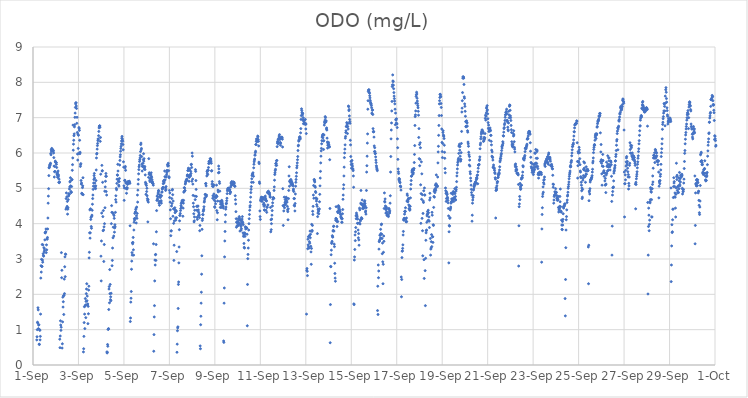
| Category | ODO (mg/L) |
|---|---|
| 44440.166666666664 | 0.71 |
| 44440.177083333336 | 0.8 |
| 44440.1875 | 1 |
| 44440.197916666664 | 1.21 |
| 44440.208333333336 | 1.19 |
| 44440.21875 | 1.62 |
| 44440.229166666664 | 1.56 |
| 44440.239583333336 | 1.03 |
| 44440.25 | 1.13 |
| 44440.260416666664 | 1.14 |
| 44440.270833333336 | 0.59 |
| 44440.28125 | 0.58 |
| 44440.291666666664 | 1 |
| 44440.302083333336 | 0.98 |
| 44440.3125 | 0.71 |
| 44440.322916666664 | 0.81 |
| 44440.333333333336 | 1.44 |
| 44440.34375 | 2.46 |
| 44440.354166666664 | 2.81 |
| 44440.364583333336 | 2.63 |
| 44440.375 | 2.99 |
| 44440.385416666664 | 2.79 |
| 44440.395833333336 | 2.79 |
| 44440.40625 | 3.41 |
| 44440.416666666664 | 2.97 |
| 44440.427083333336 | 2.91 |
| 44440.4375 | 3.4 |
| 44440.447916666664 | 3.15 |
| 44440.458333333336 | 3.1 |
| 44440.46875 | 3.08 |
| 44440.479166666664 | 3.32 |
| 44440.489583333336 | 3.2 |
| 44440.5 | 3.29 |
| 44440.510416666664 | 3.24 |
| 44440.520833333336 | 3.54 |
| 44440.53125 | 3.74 |
| 44440.541666666664 | 3.74 |
| 44440.552083333336 | 3.76 |
| 44440.5625 | 3.77 |
| 44440.572916666664 | 3.85 |
| 44440.583333333336 | 3.18 |
| 44440.59375 | 3.4 |
| 44440.604166666664 | 3.26 |
| 44440.614583333336 | 3.57 |
| 44440.625 | 3.56 |
| 44440.635416666664 | 3.61 |
| 44440.645833333336 | 3.85 |
| 44440.65625 | 4.16 |
| 44440.666666666664 | 4.58 |
| 44440.677083333336 | 4.78 |
| 44440.6875 | 4.99 |
| 44440.697916666664 | 5.36 |
| 44440.708333333336 | 5.58 |
| 44440.71875 | 5.59 |
| 44440.729166666664 | 5.63 |
| 44440.739583333336 | 5.67 |
| 44440.75 | 5.65 |
| 44440.760416666664 | 5.69 |
| 44440.770833333336 | 5.71 |
| 44440.78125 | 5.99 |
| 44440.791666666664 | 5.95 |
| 44440.802083333336 | 6.09 |
| 44440.8125 | 6.05 |
| 44440.822916666664 | 6.13 |
| 44440.833333333336 | 6.08 |
| 44440.84375 | 6.11 |
| 44440.854166666664 | 6.07 |
| 44440.864583333336 | 6.09 |
| 44440.875 | 6.06 |
| 44440.885416666664 | 6.05 |
| 44440.895833333336 | 6.07 |
| 44440.90625 | 6 |
| 44440.916666666664 | 5.87 |
| 44440.927083333336 | 5.63 |
| 44440.9375 | 5.32 |
| 44440.947916666664 | 5.47 |
| 44440.958333333336 | 5.62 |
| 44440.96875 | 5.48 |
| 44440.979166666664 | 5.77 |
| 44440.989583333336 | 5.75 |
| 44441.0 | 5.73 |
| 44441.010416666664 | 5.73 |
| 44441.020833333336 | 5.73 |
| 44441.03125 | 5.68 |
| 44441.041666666664 | 5.59 |
| 44441.052083333336 | 5.41 |
| 44441.0625 | 5.38 |
| 44441.072916666664 | 5.45 |
| 44441.083333333336 | 5.32 |
| 44441.09375 | 5.31 |
| 44441.104166666664 | 5.49 |
| 44441.114583333336 | 5.39 |
| 44441.125 | 5.35 |
| 44441.135416666664 | 5.17 |
| 44441.145833333336 | 5.26 |
| 44441.15625 | 5.16 |
| 44441.166666666664 | 5.18 |
| 44441.177083333336 | 0.73 |
| 44441.1875 | 0.49 |
| 44441.197916666664 | 0.82 |
| 44441.208333333336 | 1.25 |
| 44441.21875 | 1.13 |
| 44441.229166666664 | 0.98 |
| 44441.239583333336 | 1.07 |
| 44441.25 | 3.18 |
| 44441.260416666664 | 2.47 |
| 44441.270833333336 | 2.68 |
| 44441.28125 | 0.48 |
| 44441.291666666664 | 0.6 |
| 44441.302083333336 | 1.22 |
| 44441.3125 | 1.92 |
| 44441.322916666664 | 1.64 |
| 44441.333333333336 | 1.79 |
| 44441.34375 | 1.96 |
| 44441.354166666664 | 1.43 |
| 44441.364583333336 | 1.97 |
| 44441.375 | 2.43 |
| 44441.385416666664 | 2.02 |
| 44441.395833333336 | 2.78 |
| 44441.40625 | 3.06 |
| 44441.416666666664 | 2.5 |
| 44441.427083333336 | 3.14 |
| 44441.4375 | 3.13 |
| 44441.447916666664 | 4.41 |
| 44441.458333333336 | 4.71 |
| 44441.46875 | 4.87 |
| 44441.479166666664 | 4.45 |
| 44441.489583333336 | 4.76 |
| 44441.5 | 4.49 |
| 44441.510416666664 | 4.63 |
| 44441.520833333336 | 4.27 |
| 44441.53125 | 4.41 |
| 44441.541666666664 | 4.45 |
| 44441.552083333336 | 4.68 |
| 44441.5625 | 4.78 |
| 44441.572916666664 | 4.85 |
| 44441.583333333336 | 4.82 |
| 44441.59375 | 4.83 |
| 44441.604166666664 | 4.98 |
| 44441.614583333336 | 5.04 |
| 44441.625 | 5.18 |
| 44441.635416666664 | 5.2 |
| 44441.645833333336 | 5.3 |
| 44441.65625 | 5.07 |
| 44441.666666666664 | 4.91 |
| 44441.677083333336 | 4.88 |
| 44441.6875 | 4.89 |
| 44441.697916666664 | 5.05 |
| 44441.708333333336 | 5.24 |
| 44441.71875 | 5.25 |
| 44441.729166666664 | 5.51 |
| 44441.739583333336 | 5.67 |
| 44441.75 | 5.86 |
| 44441.760416666664 | 6.79 |
| 44441.770833333336 | 6.08 |
| 44441.78125 | 6.25 |
| 44441.791666666664 | 6.36 |
| 44441.802083333336 | 6.49 |
| 44441.8125 | 6.54 |
| 44441.822916666664 | 6.74 |
| 44441.833333333336 | 6.8 |
| 44441.84375 | 7.01 |
| 44441.854166666664 | 7.13 |
| 44441.864583333336 | 7.29 |
| 44441.875 | 7.39 |
| 44441.885416666664 | 7.42 |
| 44441.895833333336 | 7.42 |
| 44441.90625 | 7.33 |
| 44441.916666666664 | 7.26 |
| 44441.927083333336 | 6.84 |
| 44441.9375 | 7.01 |
| 44441.947916666664 | 6.58 |
| 44441.958333333336 | 5.97 |
| 44441.96875 | 5.8 |
| 44441.979166666664 | 6.53 |
| 44441.989583333336 | 6.13 |
| 44442.0 | 6.5 |
| 44442.010416666664 | 5.99 |
| 44442.020833333336 | 6.72 |
| 44442.03125 | 6.69 |
| 44442.041666666664 | 6.64 |
| 44442.052083333336 | 6.36 |
| 44442.0625 | 5.98 |
| 44442.072916666664 | 6.02 |
| 44442.083333333336 | 5.62 |
| 44442.09375 | 5.67 |
| 44442.104166666664 | 5.7 |
| 44442.114583333336 | 5.22 |
| 44442.125 | 5.12 |
| 44442.135416666664 | 5.15 |
| 44442.145833333336 | 4.86 |
| 44442.15625 | 4.85 |
| 44442.166666666664 | 4.83 |
| 44442.177083333336 | 5.02 |
| 44442.1875 | 5.07 |
| 44442.197916666664 | 5.3 |
| 44442.208333333336 | 4.82 |
| 44442.21875 | 0.37 |
| 44442.229166666664 | 0.46 |
| 44442.239583333336 | 0.81 |
| 44442.25 | 1.2 |
| 44442.260416666664 | 1.65 |
| 44442.270833333336 | 1.44 |
| 44442.28125 | 1.03 |
| 44442.291666666664 | 1.67 |
| 44442.302083333336 | 1.88 |
| 44442.3125 | 1.7 |
| 44442.322916666664 | 1.34 |
| 44442.333333333336 | 1.8 |
| 44442.34375 | 2.02 |
| 44442.354166666664 | 2.15 |
| 44442.364583333336 | 2.3 |
| 44442.375 | 1.82 |
| 44442.385416666664 | 1.95 |
| 44442.395833333336 | 1.7 |
| 44442.40625 | 1.73 |
| 44442.416666666664 | 1.17 |
| 44442.427083333336 | 1.66 |
| 44442.4375 | 1.45 |
| 44442.447916666664 | 2.12 |
| 44442.458333333336 | 2.23 |
| 44442.46875 | 3.03 |
| 44442.479166666664 | 3.19 |
| 44442.489583333336 | 3.74 |
| 44442.5 | 4.39 |
| 44442.510416666664 | 3.59 |
| 44442.520833333336 | 3.74 |
| 44442.53125 | 4.42 |
| 44442.541666666664 | 4.12 |
| 44442.552083333336 | 4.18 |
| 44442.5625 | 3.92 |
| 44442.572916666664 | 3.87 |
| 44442.583333333336 | 4.21 |
| 44442.59375 | 4.24 |
| 44442.604166666664 | 4.38 |
| 44442.614583333336 | 4.55 |
| 44442.625 | 4.71 |
| 44442.635416666664 | 4.81 |
| 44442.645833333336 | 4.97 |
| 44442.65625 | 5.06 |
| 44442.666666666664 | 5.15 |
| 44442.677083333336 | 5.25 |
| 44442.6875 | 5.36 |
| 44442.697916666664 | 5.42 |
| 44442.708333333336 | 5.29 |
| 44442.71875 | 5.15 |
| 44442.729166666664 | 5.06 |
| 44442.739583333336 | 5.01 |
| 44442.75 | 4.99 |
| 44442.760416666664 | 5.07 |
| 44442.770833333336 | 5.22 |
| 44442.78125 | 5.52 |
| 44442.791666666664 | 5.86 |
| 44442.802083333336 | 5.97 |
| 44442.8125 | 5.99 |
| 44442.822916666664 | 6.11 |
| 44442.833333333336 | 6.21 |
| 44442.84375 | 6.27 |
| 44442.854166666664 | 6.35 |
| 44442.864583333336 | 6.4 |
| 44442.875 | 6.39 |
| 44442.885416666664 | 6.49 |
| 44442.895833333336 | 6.61 |
| 44442.90625 | 6.71 |
| 44442.916666666664 | 6.76 |
| 44442.927083333336 | 6.76 |
| 44442.9375 | 6.77 |
| 44442.947916666664 | 6.73 |
| 44442.958333333336 | 6.33 |
| 44442.96875 | 6.44 |
| 44442.979166666664 | 5.4 |
| 44442.989583333336 | 3.08 |
| 44443.0 | 2.38 |
| 44443.010416666664 | 3.51 |
| 44443.020833333336 | 4.3 |
| 44443.03125 | 5.65 |
| 44443.041666666664 | 5.49 |
| 44443.052083333336 | 5.5 |
| 44443.0625 | 5.17 |
| 44443.072916666664 | 4.2 |
| 44443.083333333336 | 3.8 |
| 44443.09375 | 4.37 |
| 44443.104166666664 | 3.82 |
| 44443.114583333336 | 2.93 |
| 44443.125 | 3.91 |
| 44443.135416666664 | 3.41 |
| 44443.145833333336 | 4 |
| 44443.15625 | 4.92 |
| 44443.166666666664 | 4.45 |
| 44443.177083333336 | 5.04 |
| 44443.1875 | 5.2 |
| 44443.197916666664 | 5.34 |
| 44443.208333333336 | 5.42 |
| 44443.21875 | 4.91 |
| 44443.229166666664 | 5.34 |
| 44443.239583333336 | 4.81 |
| 44443.25 | 0.37 |
| 44443.260416666664 | 0.34 |
| 44443.270833333336 | 0.36 |
| 44443.28125 | 0.58 |
| 44443.291666666664 | 0.53 |
| 44443.302083333336 | 1.01 |
| 44443.3125 | 1.01 |
| 44443.322916666664 | 1.03 |
| 44443.333333333336 | 1.57 |
| 44443.34375 | 2.15 |
| 44443.354166666664 | 2.22 |
| 44443.364583333336 | 1.76 |
| 44443.375 | 2.7 |
| 44443.385416666664 | 2.02 |
| 44443.395833333336 | 2.28 |
| 44443.40625 | 1.85 |
| 44443.416666666664 | 1.93 |
| 44443.427083333336 | 1.82 |
| 44443.4375 | 2.03 |
| 44443.447916666664 | 4 |
| 44443.458333333336 | 4.51 |
| 44443.46875 | 4.32 |
| 44443.479166666664 | 2.81 |
| 44443.489583333336 | 2.96 |
| 44443.5 | 3.31 |
| 44443.510416666664 | 4.31 |
| 44443.520833333336 | 3.6 |
| 44443.53125 | 3.9 |
| 44443.541666666664 | 4.27 |
| 44443.552083333336 | 3.65 |
| 44443.5625 | 4.23 |
| 44443.572916666664 | 4.15 |
| 44443.583333333336 | 3.76 |
| 44443.59375 | 3.88 |
| 44443.604166666664 | 3.97 |
| 44443.614583333336 | 3.91 |
| 44443.625 | 4.32 |
| 44443.635416666664 | 4.68 |
| 44443.645833333336 | 4.79 |
| 44443.65625 | 4.61 |
| 44443.666666666664 | 5 |
| 44443.677083333336 | 4.96 |
| 44443.6875 | 5.14 |
| 44443.697916666664 | 5.26 |
| 44443.708333333336 | 5.38 |
| 44443.71875 | 5.37 |
| 44443.729166666664 | 5.68 |
| 44443.739583333336 | 5.49 |
| 44443.75 | 5.25 |
| 44443.760416666664 | 5.2 |
| 44443.770833333336 | 5.09 |
| 44443.78125 | 5.06 |
| 44443.791666666664 | 5.19 |
| 44443.802083333336 | 5.28 |
| 44443.8125 | 5.66 |
| 44443.822916666664 | 5.79 |
| 44443.833333333336 | 5.89 |
| 44443.84375 | 5.95 |
| 44443.854166666664 | 6.05 |
| 44443.864583333336 | 6.13 |
| 44443.875 | 6.19 |
| 44443.885416666664 | 6.26 |
| 44443.895833333336 | 6.34 |
| 44443.90625 | 6.42 |
| 44443.916666666664 | 6.47 |
| 44443.927083333336 | 6.4 |
| 44443.9375 | 6.36 |
| 44443.947916666664 | 6.33 |
| 44443.958333333336 | 6.24 |
| 44443.96875 | 6.09 |
| 44443.979166666664 | 5.75 |
| 44443.989583333336 | 5.6 |
| 44444.0 | 5.07 |
| 44444.010416666664 | 4.66 |
| 44444.020833333336 | 5.01 |
| 44444.03125 | 5.22 |
| 44444.041666666664 | 5.23 |
| 44444.052083333336 | 5.58 |
| 44444.0625 | 5.62 |
| 44444.072916666664 | 5.51 |
| 44444.083333333336 | 5.15 |
| 44444.09375 | 5.17 |
| 44444.104166666664 | 4.99 |
| 44444.114583333336 | 4.86 |
| 44444.125 | 5.02 |
| 44444.135416666664 | 4.98 |
| 44444.145833333336 | 5.01 |
| 44444.15625 | 5.11 |
| 44444.166666666664 | 5.13 |
| 44444.177083333336 | 5.19 |
| 44444.1875 | 5.15 |
| 44444.197916666664 | 5.19 |
| 44444.208333333336 | 5.16 |
| 44444.21875 | 5.16 |
| 44444.229166666664 | 5.19 |
| 44444.239583333336 | 5.2 |
| 44444.25 | 5.16 |
| 44444.260416666664 | 5.14 |
| 44444.270833333336 | 3.94 |
| 44444.28125 | 1.23 |
| 44444.291666666664 | 1.33 |
| 44444.302083333336 | 1.78 |
| 44444.3125 | 1.89 |
| 44444.322916666664 | 2.08 |
| 44444.333333333336 | 2.71 |
| 44444.34375 | 2.94 |
| 44444.354166666664 | 3.18 |
| 44444.364583333336 | 3.11 |
| 44444.375 | 3.46 |
| 44444.385416666664 | 3.43 |
| 44444.395833333336 | 3.47 |
| 44444.40625 | 3.61 |
| 44444.416666666664 | 3.26 |
| 44444.427083333336 | 3.11 |
| 44444.4375 | 3.82 |
| 44444.447916666664 | 4.04 |
| 44444.458333333336 | 4.14 |
| 44444.46875 | 4.1 |
| 44444.479166666664 | 4.29 |
| 44444.489583333336 | 4.15 |
| 44444.5 | 4.32 |
| 44444.510416666664 | 4.34 |
| 44444.520833333336 | 4.4 |
| 44444.53125 | 4.44 |
| 44444.541666666664 | 4.02 |
| 44444.552083333336 | 4.22 |
| 44444.5625 | 4.47 |
| 44444.572916666664 | 4.15 |
| 44444.583333333336 | 4.29 |
| 44444.59375 | 4.81 |
| 44444.604166666664 | 4.61 |
| 44444.614583333336 | 4.95 |
| 44444.625 | 5.12 |
| 44444.635416666664 | 5.25 |
| 44444.645833333336 | 5.41 |
| 44444.65625 | 5.53 |
| 44444.666666666664 | 5.61 |
| 44444.677083333336 | 5.66 |
| 44444.6875 | 5.76 |
| 44444.697916666664 | 5.81 |
| 44444.708333333336 | 5.86 |
| 44444.71875 | 5.93 |
| 44444.729166666664 | 6.04 |
| 44444.739583333336 | 6.24 |
| 44444.75 | 6.28 |
| 44444.760416666664 | 6.09 |
| 44444.770833333336 | 6.13 |
| 44444.78125 | 5.9 |
| 44444.791666666664 | 5.69 |
| 44444.802083333336 | 5.49 |
| 44444.8125 | 5.62 |
| 44444.822916666664 | 5.63 |
| 44444.833333333336 | 5.62 |
| 44444.84375 | 5.71 |
| 44444.854166666664 | 5.81 |
| 44444.864583333336 | 5.98 |
| 44444.875 | 5.77 |
| 44444.885416666664 | 5.84 |
| 44444.895833333336 | 5.55 |
| 44444.90625 | 5.59 |
| 44444.916666666664 | 5.62 |
| 44444.927083333336 | 5.53 |
| 44444.9375 | 5.38 |
| 44444.947916666664 | 5.17 |
| 44444.958333333336 | 5.12 |
| 44444.96875 | 4.83 |
| 44444.979166666664 | 5.13 |
| 44444.989583333336 | 5.08 |
| 44445.0 | 4.91 |
| 44445.010416666664 | 5 |
| 44445.020833333336 | 4.79 |
| 44445.03125 | 4.71 |
| 44445.041666666664 | 4.65 |
| 44445.052083333336 | 4.05 |
| 44445.0625 | 4.68 |
| 44445.072916666664 | 4.61 |
| 44445.083333333336 | 5.31 |
| 44445.09375 | 5.84 |
| 44445.104166666664 | 5.4 |
| 44445.114583333336 | 5.44 |
| 44445.125 | 5.41 |
| 44445.135416666664 | 5.23 |
| 44445.145833333336 | 5.19 |
| 44445.15625 | 5.38 |
| 44445.166666666664 | 5.28 |
| 44445.177083333336 | 5.39 |
| 44445.1875 | 5.28 |
| 44445.197916666664 | 5.44 |
| 44445.208333333336 | 5.34 |
| 44445.21875 | 5.31 |
| 44445.229166666664 | 5.18 |
| 44445.239583333336 | 5.24 |
| 44445.25 | 5.15 |
| 44445.260416666664 | 5.18 |
| 44445.270833333336 | 5.14 |
| 44445.28125 | 5.13 |
| 44445.291666666664 | 5.09 |
| 44445.302083333336 | 3.43 |
| 44445.3125 | 0.39 |
| 44445.322916666664 | 0.86 |
| 44445.333333333336 | 1.36 |
| 44445.34375 | 1.68 |
| 44445.354166666664 | 2.38 |
| 44445.364583333336 | 2.97 |
| 44445.375 | 2.83 |
| 44445.385416666664 | 3.12 |
| 44445.395833333336 | 3.13 |
| 44445.40625 | 2.96 |
| 44445.416666666664 | 3.41 |
| 44445.427083333336 | 3.77 |
| 44445.4375 | 4.37 |
| 44445.447916666664 | 4.66 |
| 44445.458333333336 | 4.78 |
| 44445.46875 | 4.67 |
| 44445.479166666664 | 4.7 |
| 44445.489583333336 | 4.76 |
| 44445.5 | 4.84 |
| 44445.510416666664 | 4.89 |
| 44445.520833333336 | 4.94 |
| 44445.53125 | 4.93 |
| 44445.541666666664 | 4.58 |
| 44445.552083333336 | 4.63 |
| 44445.5625 | 4.52 |
| 44445.572916666664 | 4.76 |
| 44445.583333333336 | 4.82 |
| 44445.59375 | 4.78 |
| 44445.604166666664 | 4.74 |
| 44445.614583333336 | 4.63 |
| 44445.625 | 4.62 |
| 44445.635416666664 | 4.65 |
| 44445.645833333336 | 4.58 |
| 44445.65625 | 4.79 |
| 44445.666666666664 | 4.89 |
| 44445.677083333336 | 4.9 |
| 44445.6875 | 4.98 |
| 44445.697916666664 | 4.99 |
| 44445.708333333336 | 5.02 |
| 44445.71875 | 5.03 |
| 44445.729166666664 | 5.13 |
| 44445.739583333336 | 5.19 |
| 44445.75 | 5.22 |
| 44445.760416666664 | 5.15 |
| 44445.770833333336 | 5.18 |
| 44445.78125 | 5.23 |
| 44445.791666666664 | 5.49 |
| 44445.802083333336 | 5.33 |
| 44445.8125 | 5.24 |
| 44445.822916666664 | 5.02 |
| 44445.833333333336 | 4.94 |
| 44445.84375 | 4.97 |
| 44445.854166666664 | 5.05 |
| 44445.864583333336 | 5.32 |
| 44445.875 | 5.38 |
| 44445.885416666664 | 5.44 |
| 44445.895833333336 | 5.51 |
| 44445.90625 | 5.49 |
| 44445.916666666664 | 5.67 |
| 44445.927083333336 | 5.63 |
| 44445.9375 | 5.66 |
| 44445.947916666664 | 5.71 |
| 44445.958333333336 | 5.64 |
| 44445.96875 | 5.5 |
| 44445.979166666664 | 5.33 |
| 44445.989583333336 | 5.3 |
| 44446.0 | 4.94 |
| 44446.010416666664 | 4.74 |
| 44446.020833333336 | 4.87 |
| 44446.03125 | 4.61 |
| 44446.041666666664 | 4.39 |
| 44446.052083333336 | 4.14 |
| 44446.0625 | 3.66 |
| 44446.072916666664 | 3.79 |
| 44446.083333333336 | 3.8 |
| 44446.09375 | 4.5 |
| 44446.104166666664 | 4.71 |
| 44446.114583333336 | 4.57 |
| 44446.125 | 4.95 |
| 44446.135416666664 | 4.97 |
| 44446.145833333336 | 4.82 |
| 44446.15625 | 4.21 |
| 44446.166666666664 | 4.64 |
| 44446.177083333336 | 4.42 |
| 44446.1875 | 4.01 |
| 44446.197916666664 | 2.96 |
| 44446.208333333336 | 3.39 |
| 44446.21875 | 4.08 |
| 44446.229166666664 | 4.4 |
| 44446.239583333336 | 4.45 |
| 44446.25 | 4.31 |
| 44446.260416666664 | 4.36 |
| 44446.270833333336 | 4.16 |
| 44446.28125 | 4.1 |
| 44446.291666666664 | 4.37 |
| 44446.302083333336 | 4.35 |
| 44446.3125 | 4.17 |
| 44446.322916666664 | 3.21 |
| 44446.333333333336 | 0.36 |
| 44446.34375 | 0.59 |
| 44446.354166666664 | 0.97 |
| 44446.364583333336 | 1.05 |
| 44446.375 | 1.08 |
| 44446.385416666664 | 1.6 |
| 44446.395833333336 | 2.28 |
| 44446.40625 | 2.35 |
| 44446.416666666664 | 2.89 |
| 44446.427083333336 | 3.34 |
| 44446.4375 | 3.83 |
| 44446.447916666664 | 4.08 |
| 44446.458333333336 | 4.23 |
| 44446.46875 | 4.24 |
| 44446.479166666664 | 4.29 |
| 44446.489583333336 | 4.37 |
| 44446.5 | 4.43 |
| 44446.510416666664 | 4.51 |
| 44446.520833333336 | 4.57 |
| 44446.53125 | 4.47 |
| 44446.541666666664 | 4.61 |
| 44446.552083333336 | 4.59 |
| 44446.5625 | 4.65 |
| 44446.572916666664 | 4.66 |
| 44446.583333333336 | 4.62 |
| 44446.59375 | 4.21 |
| 44446.604166666664 | 4.44 |
| 44446.614583333336 | 4.58 |
| 44446.625 | 4.66 |
| 44446.635416666664 | 4.89 |
| 44446.645833333336 | 4.91 |
| 44446.65625 | 5.02 |
| 44446.666666666664 | 5.01 |
| 44446.677083333336 | 4.93 |
| 44446.6875 | 4.94 |
| 44446.697916666664 | 5.12 |
| 44446.708333333336 | 5.15 |
| 44446.71875 | 5.19 |
| 44446.729166666664 | 5.2 |
| 44446.739583333336 | 5.22 |
| 44446.75 | 5.25 |
| 44446.760416666664 | 5.23 |
| 44446.770833333336 | 5.26 |
| 44446.78125 | 5.35 |
| 44446.791666666664 | 5.38 |
| 44446.802083333336 | 5.37 |
| 44446.8125 | 5.5 |
| 44446.822916666664 | 5.51 |
| 44446.833333333336 | 5.57 |
| 44446.84375 | 5.34 |
| 44446.854166666664 | 5.33 |
| 44446.864583333336 | 5.2 |
| 44446.875 | 5.31 |
| 44446.885416666664 | 5.55 |
| 44446.895833333336 | 5.52 |
| 44446.90625 | 5.38 |
| 44446.916666666664 | 5.37 |
| 44446.927083333336 | 5.35 |
| 44446.9375 | 5.48 |
| 44446.947916666664 | 5.42 |
| 44446.958333333336 | 5.67 |
| 44446.96875 | 5.68 |
| 44446.979166666664 | 5.59 |
| 44446.989583333336 | 5.2 |
| 44447.0 | 6 |
| 44447.010416666664 | 5.91 |
| 44447.020833333336 | 5.26 |
| 44447.03125 | 5.12 |
| 44447.041666666664 | 4.8 |
| 44447.052083333336 | 4.58 |
| 44447.0625 | 4.48 |
| 44447.072916666664 | 4.28 |
| 44447.083333333336 | 4.05 |
| 44447.09375 | 4.08 |
| 44447.104166666664 | 4.19 |
| 44447.114583333336 | 4.38 |
| 44447.125 | 4.78 |
| 44447.135416666664 | 4.68 |
| 44447.145833333336 | 5.53 |
| 44447.15625 | 5.48 |
| 44447.166666666664 | 5.22 |
| 44447.177083333336 | 4.97 |
| 44447.1875 | 4.77 |
| 44447.197916666664 | 4.49 |
| 44447.208333333336 | 4.38 |
| 44447.21875 | 4.18 |
| 44447.229166666664 | 4.12 |
| 44447.239583333336 | 4.49 |
| 44447.25 | 4.37 |
| 44447.260416666664 | 4.5 |
| 44447.270833333336 | 4.39 |
| 44447.28125 | 4.23 |
| 44447.291666666664 | 4.32 |
| 44447.302083333336 | 4.27 |
| 44447.3125 | 4.24 |
| 44447.322916666664 | 4.17 |
| 44447.333333333336 | 3.8 |
| 44447.34375 | 3.95 |
| 44447.354166666664 | 0.54 |
| 44447.364583333336 | 0.46 |
| 44447.375 | 1.14 |
| 44447.385416666664 | 1.38 |
| 44447.395833333336 | 1.75 |
| 44447.40625 | 2.06 |
| 44447.416666666664 | 2.57 |
| 44447.427083333336 | 3.09 |
| 44447.4375 | 3.84 |
| 44447.447916666664 | 4.09 |
| 44447.458333333336 | 4.14 |
| 44447.46875 | 4.26 |
| 44447.479166666664 | 4.25 |
| 44447.489583333336 | 4.35 |
| 44447.5 | 4.38 |
| 44447.510416666664 | 4.41 |
| 44447.520833333336 | 4.48 |
| 44447.53125 | 4.61 |
| 44447.541666666664 | 4.64 |
| 44447.552083333336 | 4.7 |
| 44447.5625 | 4.73 |
| 44447.572916666664 | 4.83 |
| 44447.583333333336 | 4.82 |
| 44447.59375 | 5.13 |
| 44447.604166666664 | 5.14 |
| 44447.614583333336 | 5.07 |
| 44447.625 | 4.77 |
| 44447.635416666664 | 4.81 |
| 44447.645833333336 | 5.35 |
| 44447.65625 | 5.48 |
| 44447.666666666664 | 5.43 |
| 44447.677083333336 | 5.51 |
| 44447.6875 | 5.39 |
| 44447.697916666664 | 5.51 |
| 44447.708333333336 | 5.51 |
| 44447.71875 | 5.59 |
| 44447.729166666664 | 5.7 |
| 44447.739583333336 | 5.76 |
| 44447.75 | 5.72 |
| 44447.760416666664 | 5.77 |
| 44447.770833333336 | 5.75 |
| 44447.78125 | 5.72 |
| 44447.791666666664 | 5.84 |
| 44447.802083333336 | 5.83 |
| 44447.8125 | 5.83 |
| 44447.822916666664 | 5.83 |
| 44447.833333333336 | 5.77 |
| 44447.84375 | 5.71 |
| 44447.854166666664 | 5.49 |
| 44447.864583333336 | 5.5 |
| 44447.875 | 5.12 |
| 44447.885416666664 | 5.19 |
| 44447.895833333336 | 5.06 |
| 44447.90625 | 4.72 |
| 44447.916666666664 | 4.79 |
| 44447.927083333336 | 5.05 |
| 44447.9375 | 5.09 |
| 44447.947916666664 | 5.1 |
| 44447.958333333336 | 4.84 |
| 44447.96875 | 4.67 |
| 44447.979166666664 | 4.76 |
| 44447.989583333336 | 4.48 |
| 44448.0 | 4.46 |
| 44448.010416666664 | 4.75 |
| 44448.020833333336 | 4.63 |
| 44448.03125 | 4.56 |
| 44448.041666666664 | 4.73 |
| 44448.052083333336 | 4.78 |
| 44448.0625 | 4.8 |
| 44448.072916666664 | 5.09 |
| 44448.083333333336 | 4.37 |
| 44448.09375 | 4.77 |
| 44448.104166666664 | 4.11 |
| 44448.114583333336 | 4.31 |
| 44448.125 | 4.64 |
| 44448.135416666664 | 4.95 |
| 44448.145833333336 | 4.9 |
| 44448.15625 | 5.44 |
| 44448.166666666664 | 5.63 |
| 44448.177083333336 | 5.55 |
| 44448.1875 | 5.45 |
| 44448.197916666664 | 5.19 |
| 44448.208333333336 | 5.14 |
| 44448.21875 | 4.92 |
| 44448.229166666664 | 4.63 |
| 44448.239583333336 | 4.46 |
| 44448.25 | 4.55 |
| 44448.260416666664 | 4.62 |
| 44448.270833333336 | 4.63 |
| 44448.28125 | 4.46 |
| 44448.291666666664 | 4.55 |
| 44448.302083333336 | 4.66 |
| 44448.3125 | 4.64 |
| 44448.322916666664 | 4.61 |
| 44448.333333333336 | 4.56 |
| 44448.34375 | 4.51 |
| 44448.354166666664 | 4.5 |
| 44448.364583333336 | 4.48 |
| 44448.375 | 4.44 |
| 44448.385416666664 | 0.68 |
| 44448.395833333336 | 0.64 |
| 44448.40625 | 1.75 |
| 44448.416666666664 | 2.18 |
| 44448.427083333336 | 3.06 |
| 44448.4375 | 3.51 |
| 44448.447916666664 | 3.78 |
| 44448.458333333336 | 4.05 |
| 44448.46875 | 4.25 |
| 44448.479166666664 | 4.41 |
| 44448.489583333336 | 4.47 |
| 44448.5 | 4.56 |
| 44448.510416666664 | 4.58 |
| 44448.520833333336 | 4.65 |
| 44448.53125 | 4.72 |
| 44448.541666666664 | 4.85 |
| 44448.552083333336 | 4.93 |
| 44448.5625 | 4.97 |
| 44448.572916666664 | 5 |
| 44448.583333333336 | 4.98 |
| 44448.59375 | 4.99 |
| 44448.604166666664 | 4.96 |
| 44448.614583333336 | 5.01 |
| 44448.625 | 4.98 |
| 44448.635416666664 | 4.94 |
| 44448.645833333336 | 4.95 |
| 44448.65625 | 4.96 |
| 44448.666666666664 | 4.85 |
| 44448.677083333336 | 4.91 |
| 44448.6875 | 4.89 |
| 44448.697916666664 | 5.04 |
| 44448.708333333336 | 5.15 |
| 44448.71875 | 5.08 |
| 44448.729166666664 | 5.13 |
| 44448.739583333336 | 5.18 |
| 44448.75 | 5.19 |
| 44448.760416666664 | 5.1 |
| 44448.770833333336 | 5.11 |
| 44448.78125 | 5.11 |
| 44448.791666666664 | 5.16 |
| 44448.802083333336 | 5.16 |
| 44448.8125 | 5.18 |
| 44448.822916666664 | 5.17 |
| 44448.833333333336 | 5.16 |
| 44448.84375 | 5.17 |
| 44448.854166666664 | 5.13 |
| 44448.864583333336 | 5.07 |
| 44448.875 | 5.06 |
| 44448.885416666664 | 5.06 |
| 44448.895833333336 | 4.79 |
| 44448.90625 | 4.68 |
| 44448.916666666664 | 4.56 |
| 44448.927083333336 | 4.34 |
| 44448.9375 | 4.14 |
| 44448.947916666664 | 3.9 |
| 44448.958333333336 | 4.04 |
| 44448.96875 | 4.04 |
| 44448.979166666664 | 3.94 |
| 44448.989583333336 | 4.06 |
| 44449.0 | 3.95 |
| 44449.010416666664 | 4.03 |
| 44449.020833333336 | 4.14 |
| 44449.03125 | 3.95 |
| 44449.041666666664 | 4.03 |
| 44449.052083333336 | 4 |
| 44449.0625 | 4.1 |
| 44449.072916666664 | 4.2 |
| 44449.083333333336 | 4.16 |
| 44449.09375 | 4.12 |
| 44449.104166666664 | 3.79 |
| 44449.114583333336 | 3.99 |
| 44449.125 | 4.09 |
| 44449.135416666664 | 3.96 |
| 44449.145833333336 | 3.92 |
| 44449.15625 | 3.82 |
| 44449.166666666664 | 3.86 |
| 44449.177083333336 | 4.03 |
| 44449.1875 | 4.08 |
| 44449.197916666664 | 4.13 |
| 44449.208333333336 | 4.2 |
| 44449.21875 | 4 |
| 44449.229166666664 | 4.04 |
| 44449.239583333336 | 3.74 |
| 44449.25 | 3.97 |
| 44449.260416666664 | 3.64 |
| 44449.270833333336 | 3.68 |
| 44449.28125 | 3.44 |
| 44449.291666666664 | 3.33 |
| 44449.302083333336 | 3.31 |
| 44449.3125 | 3.74 |
| 44449.322916666664 | 3.64 |
| 44449.333333333336 | 3.71 |
| 44449.34375 | 3.91 |
| 44449.354166666664 | 3.85 |
| 44449.364583333336 | 3.9 |
| 44449.375 | 3.89 |
| 44449.385416666664 | 3.89 |
| 44449.395833333336 | 3.88 |
| 44449.40625 | 3.87 |
| 44449.416666666664 | 3.7 |
| 44449.427083333336 | 1.11 |
| 44449.4375 | 2.28 |
| 44449.447916666664 | 3.01 |
| 44449.458333333336 | 3.13 |
| 44449.46875 | 3.31 |
| 44449.479166666664 | 3.53 |
| 44449.489583333336 | 3.82 |
| 44449.5 | 4 |
| 44449.510416666664 | 4.14 |
| 44449.520833333336 | 4.26 |
| 44449.53125 | 4.38 |
| 44449.541666666664 | 4.47 |
| 44449.552083333336 | 4.51 |
| 44449.5625 | 4.61 |
| 44449.572916666664 | 4.75 |
| 44449.583333333336 | 4.88 |
| 44449.59375 | 4.97 |
| 44449.604166666664 | 5.05 |
| 44449.614583333336 | 5.17 |
| 44449.625 | 5.27 |
| 44449.635416666664 | 5.36 |
| 44449.645833333336 | 5.38 |
| 44449.65625 | 5.41 |
| 44449.666666666664 | 5.4 |
| 44449.677083333336 | 5.44 |
| 44449.6875 | 5.17 |
| 44449.697916666664 | 5.34 |
| 44449.708333333336 | 5.58 |
| 44449.71875 | 5.68 |
| 44449.729166666664 | 5.75 |
| 44449.739583333336 | 5.8 |
| 44449.75 | 5.83 |
| 44449.760416666664 | 5.94 |
| 44449.770833333336 | 5.94 |
| 44449.78125 | 6.01 |
| 44449.791666666664 | 6.05 |
| 44449.802083333336 | 6.24 |
| 44449.8125 | 6.24 |
| 44449.822916666664 | 6.33 |
| 44449.833333333336 | 6.4 |
| 44449.84375 | 6.37 |
| 44449.854166666664 | 6.32 |
| 44449.864583333336 | 6.36 |
| 44449.875 | 6.39 |
| 44449.885416666664 | 6.48 |
| 44449.895833333336 | 6.46 |
| 44449.90625 | 6.38 |
| 44449.916666666664 | 6.33 |
| 44449.927083333336 | 6.2 |
| 44449.9375 | 5.74 |
| 44449.947916666664 | 5.7 |
| 44449.958333333336 | 5.18 |
| 44449.96875 | 5.14 |
| 44449.979166666664 | 4.36 |
| 44449.989583333336 | 4.2 |
| 44450.0 | 4.12 |
| 44450.010416666664 | 4.65 |
| 44450.020833333336 | 4.68 |
| 44450.03125 | 4.72 |
| 44450.041666666664 | 4.75 |
| 44450.052083333336 | 4.72 |
| 44450.0625 | 4.74 |
| 44450.072916666664 | 4.63 |
| 44450.083333333336 | 4.69 |
| 44450.09375 | 4.73 |
| 44450.104166666664 | 4.7 |
| 44450.114583333336 | 4.74 |
| 44450.125 | 4.73 |
| 44450.135416666664 | 4.54 |
| 44450.145833333336 | 4.69 |
| 44450.15625 | 4.58 |
| 44450.166666666664 | 4.49 |
| 44450.177083333336 | 4.39 |
| 44450.1875 | 4.38 |
| 44450.197916666664 | 4.52 |
| 44450.208333333336 | 4.74 |
| 44450.21875 | 4.78 |
| 44450.229166666664 | 4.66 |
| 44450.239583333336 | 4.7 |
| 44450.25 | 4.38 |
| 44450.260416666664 | 4.66 |
| 44450.270833333336 | 4.64 |
| 44450.28125 | 4.32 |
| 44450.291666666664 | 4.46 |
| 44450.302083333336 | 4.47 |
| 44450.3125 | 4.89 |
| 44450.322916666664 | 4.88 |
| 44450.333333333336 | 4.53 |
| 44450.34375 | 4.86 |
| 44450.354166666664 | 4.92 |
| 44450.364583333336 | 4.86 |
| 44450.375 | 4.89 |
| 44450.385416666664 | 4.86 |
| 44450.395833333336 | 4.88 |
| 44450.40625 | 4.84 |
| 44450.416666666664 | 4.81 |
| 44450.427083333336 | 4.76 |
| 44450.4375 | 4.75 |
| 44450.447916666664 | 4.46 |
| 44450.458333333336 | 3.77 |
| 44450.46875 | 4.11 |
| 44450.479166666664 | 3.83 |
| 44450.489583333336 | 4 |
| 44450.5 | 4.13 |
| 44450.510416666664 | 4.24 |
| 44450.520833333336 | 4.37 |
| 44450.53125 | 4.5 |
| 44450.541666666664 | 4.59 |
| 44450.552083333336 | 4.69 |
| 44450.5625 | 4.73 |
| 44450.572916666664 | 4.74 |
| 44450.583333333336 | 4.72 |
| 44450.59375 | 4.72 |
| 44450.604166666664 | 4.94 |
| 44450.614583333336 | 5.04 |
| 44450.625 | 5.23 |
| 44450.635416666664 | 5.39 |
| 44450.645833333336 | 5.44 |
| 44450.65625 | 5.5 |
| 44450.666666666664 | 5.54 |
| 44450.677083333336 | 5.7 |
| 44450.6875 | 5.65 |
| 44450.697916666664 | 5.71 |
| 44450.708333333336 | 5.78 |
| 44450.71875 | 5.65 |
| 44450.729166666664 | 5.79 |
| 44450.739583333336 | 6.18 |
| 44450.75 | 6.28 |
| 44450.760416666664 | 6.33 |
| 44450.770833333336 | 6.31 |
| 44450.78125 | 6.39 |
| 44450.791666666664 | 6.26 |
| 44450.802083333336 | 6.29 |
| 44450.8125 | 6.39 |
| 44450.822916666664 | 6.48 |
| 44450.833333333336 | 6.44 |
| 44450.84375 | 6.52 |
| 44450.854166666664 | 6.38 |
| 44450.864583333336 | 6.43 |
| 44450.875 | 6.3 |
| 44450.885416666664 | 6.22 |
| 44450.895833333336 | 6.28 |
| 44450.90625 | 6.41 |
| 44450.916666666664 | 6.44 |
| 44450.927083333336 | 6.44 |
| 44450.9375 | 6.43 |
| 44450.947916666664 | 6.45 |
| 44450.958333333336 | 6.43 |
| 44450.96875 | 6.39 |
| 44450.979166666664 | 6.17 |
| 44450.989583333336 | 4.99 |
| 44451.0 | 4.51 |
| 44451.010416666664 | 3.95 |
| 44451.020833333336 | 4.51 |
| 44451.03125 | 4.36 |
| 44451.041666666664 | 4.51 |
| 44451.052083333336 | 4.75 |
| 44451.0625 | 4.45 |
| 44451.072916666664 | 4.54 |
| 44451.083333333336 | 4.59 |
| 44451.09375 | 4.68 |
| 44451.104166666664 | 4.62 |
| 44451.114583333336 | 4.54 |
| 44451.125 | 4.59 |
| 44451.135416666664 | 4.75 |
| 44451.145833333336 | 4.72 |
| 44451.15625 | 4.66 |
| 44451.166666666664 | 4.72 |
| 44451.177083333336 | 4.61 |
| 44451.1875 | 4.49 |
| 44451.197916666664 | 4.39 |
| 44451.208333333336 | 4.34 |
| 44451.21875 | 4.11 |
| 44451.229166666664 | 4.42 |
| 44451.239583333336 | 4.71 |
| 44451.25 | 4.94 |
| 44451.260416666664 | 5.35 |
| 44451.270833333336 | 5.61 |
| 44451.28125 | 5.06 |
| 44451.291666666664 | 5.19 |
| 44451.302083333336 | 5.22 |
| 44451.3125 | 5.19 |
| 44451.322916666664 | 5.17 |
| 44451.333333333336 | 5.22 |
| 44451.34375 | 5.25 |
| 44451.354166666664 | 5.13 |
| 44451.364583333336 | 5.1 |
| 44451.375 | 5.2 |
| 44451.385416666664 | 5.15 |
| 44451.395833333336 | 5.16 |
| 44451.40625 | 5.13 |
| 44451.416666666664 | 5.11 |
| 44451.427083333336 | 5.09 |
| 44451.4375 | 5.07 |
| 44451.447916666664 | 4.95 |
| 44451.458333333336 | 4.98 |
| 44451.46875 | 4.91 |
| 44451.479166666664 | 4.71 |
| 44451.489583333336 | 4.52 |
| 44451.5 | 4.71 |
| 44451.510416666664 | 4.5 |
| 44451.520833333336 | 4.36 |
| 44451.53125 | 4.57 |
| 44451.541666666664 | 4.84 |
| 44451.552083333336 | 5.06 |
| 44451.5625 | 5.17 |
| 44451.572916666664 | 5.25 |
| 44451.583333333336 | 5.34 |
| 44451.59375 | 5.44 |
| 44451.604166666664 | 5.58 |
| 44451.614583333336 | 5.64 |
| 44451.625 | 5.72 |
| 44451.635416666664 | 5.81 |
| 44451.645833333336 | 5.9 |
| 44451.65625 | 6.07 |
| 44451.666666666664 | 6.2 |
| 44451.677083333336 | 6.22 |
| 44451.6875 | 6.34 |
| 44451.697916666664 | 6.34 |
| 44451.708333333336 | 6.38 |
| 44451.71875 | 6.43 |
| 44451.729166666664 | 6.46 |
| 44451.739583333336 | 6.43 |
| 44451.75 | 6.45 |
| 44451.760416666664 | 6.4 |
| 44451.770833333336 | 6.57 |
| 44451.78125 | 6.69 |
| 44451.791666666664 | 6.95 |
| 44451.802083333336 | 7.06 |
| 44451.8125 | 7.25 |
| 44451.822916666664 | 7.2 |
| 44451.833333333336 | 7.14 |
| 44451.84375 | 7.07 |
| 44451.854166666664 | 7.13 |
| 44451.864583333336 | 7.11 |
| 44451.875 | 6.94 |
| 44451.885416666664 | 7 |
| 44451.895833333336 | 6.83 |
| 44451.90625 | 6.9 |
| 44451.916666666664 | 6.93 |
| 44451.927083333336 | 6.93 |
| 44451.9375 | 6.83 |
| 44451.947916666664 | 6.84 |
| 44451.958333333336 | 6.82 |
| 44451.96875 | 6.85 |
| 44451.979166666664 | 6.95 |
| 44451.989583333336 | 6.81 |
| 44452.0 | 6.68 |
| 44452.010416666664 | 6.82 |
| 44452.020833333336 | 6.55 |
| 44452.03125 | 1.44 |
| 44452.041666666664 | 2.68 |
| 44452.052083333336 | 2.73 |
| 44452.0625 | 2.65 |
| 44452.072916666664 | 2.53 |
| 44452.083333333336 | 3.29 |
| 44452.09375 | 3.56 |
| 44452.104166666664 | 3.4 |
| 44452.114583333336 | 3.63 |
| 44452.125 | 3.35 |
| 44452.135416666664 | 3.64 |
| 44452.145833333336 | 3.31 |
| 44452.15625 | 3.49 |
| 44452.166666666664 | 3.67 |
| 44452.177083333336 | 3.45 |
| 44452.1875 | 3.79 |
| 44452.197916666664 | 3.6 |
| 44452.208333333336 | 3.7 |
| 44452.21875 | 3.36 |
| 44452.229166666664 | 3.2 |
| 44452.239583333336 | 2.85 |
| 44452.25 | 3.3 |
| 44452.260416666664 | 3.98 |
| 44452.270833333336 | 3.78 |
| 44452.28125 | 3.81 |
| 44452.291666666664 | 3.95 |
| 44452.302083333336 | 4.35 |
| 44452.3125 | 4.26 |
| 44452.322916666664 | 4.49 |
| 44452.333333333336 | 4.81 |
| 44452.34375 | 5.08 |
| 44452.354166666664 | 4.72 |
| 44452.364583333336 | 5.24 |
| 44452.375 | 5.25 |
| 44452.385416666664 | 5.21 |
| 44452.395833333336 | 5.18 |
| 44452.40625 | 5.06 |
| 44452.416666666664 | 5.03 |
| 44452.427083333336 | 4.91 |
| 44452.4375 | 4.88 |
| 44452.447916666664 | 4.73 |
| 44452.458333333336 | 4.71 |
| 44452.46875 | 4.64 |
| 44452.479166666664 | 4.54 |
| 44452.489583333336 | 4.7 |
| 44452.5 | 4.49 |
| 44452.510416666664 | 3.72 |
| 44452.520833333336 | 4.2 |
| 44452.53125 | 4.3 |
| 44452.541666666664 | 4.41 |
| 44452.552083333336 | 4.39 |
| 44452.5625 | 4.35 |
| 44452.572916666664 | 4.28 |
| 44452.583333333336 | 4.4 |
| 44452.59375 | 4.42 |
| 44452.604166666664 | 4.62 |
| 44452.614583333336 | 4.83 |
| 44452.625 | 5.07 |
| 44452.635416666664 | 5.29 |
| 44452.645833333336 | 5.48 |
| 44452.65625 | 5.72 |
| 44452.666666666664 | 5.91 |
| 44452.677083333336 | 6.06 |
| 44452.6875 | 6.13 |
| 44452.697916666664 | 6.26 |
| 44452.708333333336 | 6.35 |
| 44452.71875 | 6.45 |
| 44452.729166666664 | 6.48 |
| 44452.739583333336 | 6.51 |
| 44452.75 | 6.43 |
| 44452.760416666664 | 6.53 |
| 44452.770833333336 | 6.34 |
| 44452.78125 | 6.1 |
| 44452.791666666664 | 6.35 |
| 44452.802083333336 | 6.51 |
| 44452.8125 | 6.79 |
| 44452.822916666664 | 6.88 |
| 44452.833333333336 | 6.85 |
| 44452.84375 | 6.93 |
| 44452.854166666664 | 7.03 |
| 44452.864583333336 | 7 |
| 44452.875 | 6.88 |
| 44452.885416666664 | 6.88 |
| 44452.895833333336 | 6.91 |
| 44452.90625 | 6.68 |
| 44452.916666666664 | 6.71 |
| 44452.927083333336 | 6.65 |
| 44452.9375 | 6.42 |
| 44452.947916666664 | 6.31 |
| 44452.958333333336 | 6.14 |
| 44452.96875 | 6.22 |
| 44452.979166666664 | 6.27 |
| 44452.989583333336 | 6.25 |
| 44453.0 | 6.3 |
| 44453.010416666664 | 6.24 |
| 44453.020833333336 | 6.2 |
| 44453.03125 | 6.18 |
| 44453.041666666664 | 6.17 |
| 44453.052083333336 | 5.81 |
| 44453.0625 | 4.43 |
| 44453.072916666664 | 0.63 |
| 44453.083333333336 | 1.71 |
| 44453.09375 | 2.79 |
| 44453.104166666664 | 2.78 |
| 44453.114583333336 | 3.12 |
| 44453.125 | 3.25 |
| 44453.135416666664 | 3.44 |
| 44453.145833333336 | 3.47 |
| 44453.15625 | 3.5 |
| 44453.166666666664 | 3.66 |
| 44453.177083333336 | 3.63 |
| 44453.1875 | 3.62 |
| 44453.197916666664 | 3.79 |
| 44453.208333333336 | 3.81 |
| 44453.21875 | 3.92 |
| 44453.229166666664 | 3.93 |
| 44453.239583333336 | 3.79 |
| 44453.25 | 3.42 |
| 44453.260416666664 | 3.35 |
| 44453.270833333336 | 2.88 |
| 44453.28125 | 2.59 |
| 44453.291666666664 | 2.46 |
| 44453.302083333336 | 2.37 |
| 44453.3125 | 4.1 |
| 44453.322916666664 | 4.15 |
| 44453.333333333336 | 4.48 |
| 44453.34375 | 4.14 |
| 44453.354166666664 | 4.11 |
| 44453.364583333336 | 4.07 |
| 44453.375 | 3.92 |
| 44453.385416666664 | 4.06 |
| 44453.395833333336 | 4.34 |
| 44453.40625 | 4.06 |
| 44453.416666666664 | 4.31 |
| 44453.427083333336 | 4.48 |
| 44453.4375 | 4.51 |
| 44453.447916666664 | 4.42 |
| 44453.458333333336 | 4.38 |
| 44453.46875 | 4.47 |
| 44453.479166666664 | 4.41 |
| 44453.489583333336 | 4.34 |
| 44453.5 | 4.37 |
| 44453.510416666664 | 4.33 |
| 44453.520833333336 | 4.27 |
| 44453.53125 | 4.26 |
| 44453.541666666664 | 4.21 |
| 44453.552083333336 | 4.17 |
| 44453.5625 | 4.17 |
| 44453.572916666664 | 4.14 |
| 44453.583333333336 | 4.04 |
| 44453.59375 | 4.04 |
| 44453.604166666664 | 4.14 |
| 44453.614583333336 | 4.28 |
| 44453.625 | 4.4 |
| 44453.635416666664 | 4.69 |
| 44453.645833333336 | 4.81 |
| 44453.65625 | 4.99 |
| 44453.666666666664 | 5.1 |
| 44453.677083333336 | 5.35 |
| 44453.6875 | 5.6 |
| 44453.697916666664 | 5.87 |
| 44453.708333333336 | 6 |
| 44453.71875 | 6.11 |
| 44453.729166666664 | 6.23 |
| 44453.739583333336 | 6.42 |
| 44453.75 | 6.47 |
| 44453.760416666664 | 6.58 |
| 44453.770833333336 | 6.63 |
| 44453.78125 | 6.75 |
| 44453.791666666664 | 6.75 |
| 44453.802083333336 | 6.86 |
| 44453.8125 | 6.82 |
| 44453.822916666664 | 6.75 |
| 44453.833333333336 | 6.55 |
| 44453.84375 | 6.75 |
| 44453.854166666664 | 6.84 |
| 44453.864583333336 | 6.68 |
| 44453.875 | 7.33 |
| 44453.885416666664 | 7.31 |
| 44453.895833333336 | 7.2 |
| 44453.90625 | 7.23 |
| 44453.916666666664 | 7.05 |
| 44453.927083333336 | 6.95 |
| 44453.9375 | 6.89 |
| 44453.947916666664 | 6.84 |
| 44453.958333333336 | 6.36 |
| 44453.96875 | 6.23 |
| 44453.979166666664 | 5.9 |
| 44453.989583333336 | 5.76 |
| 44454.0 | 5.67 |
| 44454.010416666664 | 5.57 |
| 44454.020833333336 | 5.69 |
| 44454.03125 | 5.79 |
| 44454.041666666664 | 5.69 |
| 44454.052083333336 | 5.63 |
| 44454.0625 | 5.56 |
| 44454.072916666664 | 5.54 |
| 44454.083333333336 | 5.5 |
| 44454.09375 | 5.35 |
| 44454.104166666664 | 5.03 |
| 44454.114583333336 | 1.73 |
| 44454.125 | 1.71 |
| 44454.135416666664 | 2.97 |
| 44454.145833333336 | 3.06 |
| 44454.15625 | 3.27 |
| 44454.166666666664 | 3.68 |
| 44454.177083333336 | 3.52 |
| 44454.1875 | 3.77 |
| 44454.197916666664 | 3.89 |
| 44454.208333333336 | 4.22 |
| 44454.21875 | 4.14 |
| 44454.229166666664 | 4.3 |
| 44454.239583333336 | 4.25 |
| 44454.25 | 4.22 |
| 44454.260416666664 | 4.19 |
| 44454.270833333336 | 4.01 |
| 44454.28125 | 4.13 |
| 44454.291666666664 | 4.01 |
| 44454.302083333336 | 3.82 |
| 44454.3125 | 3.6 |
| 44454.322916666664 | 3.72 |
| 44454.333333333336 | 3.54 |
| 44454.34375 | 3.39 |
| 44454.354166666664 | 4.02 |
| 44454.364583333336 | 4.44 |
| 44454.375 | 4.39 |
| 44454.385416666664 | 3.99 |
| 44454.395833333336 | 4.11 |
| 44454.40625 | 4.08 |
| 44454.416666666664 | 4.58 |
| 44454.427083333336 | 4.94 |
| 44454.4375 | 4.55 |
| 44454.447916666664 | 4.17 |
| 44454.458333333336 | 4.14 |
| 44454.46875 | 4.14 |
| 44454.479166666664 | 4.67 |
| 44454.489583333336 | 4.43 |
| 44454.5 | 4.52 |
| 44454.510416666664 | 4.56 |
| 44454.520833333336 | 4.5 |
| 44454.53125 | 4.47 |
| 44454.541666666664 | 4.43 |
| 44454.552083333336 | 4.45 |
| 44454.5625 | 4.48 |
| 44454.572916666664 | 4.55 |
| 44454.583333333336 | 4.62 |
| 44454.59375 | 4.65 |
| 44454.604166666664 | 4.57 |
| 44454.614583333336 | 4.5 |
| 44454.625 | 4.33 |
| 44454.635416666664 | 4.36 |
| 44454.645833333336 | 4.27 |
| 44454.65625 | 4.45 |
| 44454.666666666664 | 4.94 |
| 44454.677083333336 | 5.46 |
| 44454.6875 | 5.64 |
| 44454.697916666664 | 5.91 |
| 44454.708333333336 | 6.28 |
| 44454.71875 | 6.54 |
| 44454.729166666664 | 7.24 |
| 44454.739583333336 | 7.48 |
| 44454.75 | 7.74 |
| 44454.760416666664 | 7.78 |
| 44454.770833333336 | 7.78 |
| 44454.78125 | 7.79 |
| 44454.791666666664 | 7.72 |
| 44454.802083333336 | 7.69 |
| 44454.8125 | 7.62 |
| 44454.822916666664 | 7.56 |
| 44454.833333333336 | 7.49 |
| 44454.84375 | 7.44 |
| 44454.854166666664 | 7.41 |
| 44454.864583333336 | 7.38 |
| 44454.875 | 7.39 |
| 44454.885416666664 | 7.34 |
| 44454.895833333336 | 7.28 |
| 44454.90625 | 7.13 |
| 44454.916666666664 | 7.11 |
| 44454.927083333336 | 7.21 |
| 44454.9375 | 7.22 |
| 44454.947916666664 | 7.09 |
| 44454.958333333336 | 6.69 |
| 44454.96875 | 6.6 |
| 44454.979166666664 | 6.61 |
| 44454.989583333336 | 6.6 |
| 44455.0 | 6.45 |
| 44455.010416666664 | 6.2 |
| 44455.020833333336 | 6.04 |
| 44455.03125 | 6.15 |
| 44455.041666666664 | 6.04 |
| 44455.052083333336 | 5.98 |
| 44455.0625 | 5.99 |
| 44455.072916666664 | 5.89 |
| 44455.083333333336 | 5.8 |
| 44455.09375 | 5.73 |
| 44455.104166666664 | 5.64 |
| 44455.114583333336 | 5.6 |
| 44455.125 | 5.55 |
| 44455.135416666664 | 5.54 |
| 44455.145833333336 | 5.5 |
| 44455.15625 | 1.54 |
| 44455.166666666664 | 2.23 |
| 44455.177083333336 | 1.43 |
| 44455.1875 | 2.83 |
| 44455.197916666664 | 2.47 |
| 44455.208333333336 | 2.66 |
| 44455.21875 | 3.28 |
| 44455.229166666664 | 3.49 |
| 44455.239583333336 | 3.51 |
| 44455.25 | 3.54 |
| 44455.260416666664 | 3.67 |
| 44455.270833333336 | 3.68 |
| 44455.28125 | 3.59 |
| 44455.291666666664 | 3.84 |
| 44455.302083333336 | 3.72 |
| 44455.3125 | 3.59 |
| 44455.322916666664 | 3.97 |
| 44455.333333333336 | 3.99 |
| 44455.34375 | 3.7 |
| 44455.354166666664 | 3.58 |
| 44455.364583333336 | 3.15 |
| 44455.375 | 3.45 |
| 44455.385416666664 | 2.92 |
| 44455.395833333336 | 2.3 |
| 44455.40625 | 2.85 |
| 44455.416666666664 | 3.19 |
| 44455.427083333336 | 3.65 |
| 44455.4375 | 3.5 |
| 44455.447916666664 | 4.43 |
| 44455.458333333336 | 4.87 |
| 44455.46875 | 4.63 |
| 44455.479166666664 | 4.61 |
| 44455.489583333336 | 4.7 |
| 44455.5 | 4.5 |
| 44455.510416666664 | 4.43 |
| 44455.520833333336 | 4.3 |
| 44455.53125 | 4.39 |
| 44455.541666666664 | 4.47 |
| 44455.552083333336 | 4.44 |
| 44455.5625 | 4.33 |
| 44455.572916666664 | 4.23 |
| 44455.583333333336 | 4.27 |
| 44455.59375 | 4.25 |
| 44455.604166666664 | 4.24 |
| 44455.614583333336 | 4.25 |
| 44455.625 | 4.24 |
| 44455.635416666664 | 4.2 |
| 44455.645833333336 | 4.41 |
| 44455.65625 | 4.43 |
| 44455.666666666664 | 4.41 |
| 44455.677083333336 | 4.33 |
| 44455.6875 | 4.3 |
| 44455.697916666664 | 4.36 |
| 44455.708333333336 | 4.58 |
| 44455.71875 | 4.79 |
| 44455.729166666664 | 5.46 |
| 44455.739583333336 | 5.9 |
| 44455.75 | 6.4 |
| 44455.760416666664 | 6.65 |
| 44455.770833333336 | 6.85 |
| 44455.78125 | 7.19 |
| 44455.791666666664 | 7.46 |
| 44455.802083333336 | 7.88 |
| 44455.8125 | 7.93 |
| 44455.822916666664 | 8.21 |
| 44455.833333333336 | 8.04 |
| 44455.84375 | 8.02 |
| 44455.854166666664 | 7.92 |
| 44455.864583333336 | 7.82 |
| 44455.875 | 7.71 |
| 44455.885416666664 | 7.61 |
| 44455.895833333336 | 7.54 |
| 44455.90625 | 7.47 |
| 44455.916666666664 | 7.39 |
| 44455.927083333336 | 7.24 |
| 44455.9375 | 6.8 |
| 44455.947916666664 | 7.13 |
| 44455.958333333336 | 6.95 |
| 44455.96875 | 6.93 |
| 44455.979166666664 | 6.85 |
| 44455.989583333336 | 6.97 |
| 44456.0 | 6.83 |
| 44456.010416666664 | 6.82 |
| 44456.020833333336 | 6.72 |
| 44456.03125 | 6.4 |
| 44456.041666666664 | 6.15 |
| 44456.052083333336 | 5.82 |
| 44456.0625 | 5.55 |
| 44456.072916666664 | 5.47 |
| 44456.083333333336 | 5.42 |
| 44456.09375 | 5.24 |
| 44456.104166666664 | 5.28 |
| 44456.114583333336 | 5.21 |
| 44456.125 | 5.26 |
| 44456.135416666664 | 5.18 |
| 44456.145833333336 | 5.16 |
| 44456.15625 | 5.06 |
| 44456.166666666664 | 5.06 |
| 44456.177083333336 | 5.04 |
| 44456.1875 | 4.95 |
| 44456.197916666664 | 2.49 |
| 44456.208333333336 | 1.93 |
| 44456.21875 | 2.42 |
| 44456.229166666664 | 3.04 |
| 44456.239583333336 | 3.22 |
| 44456.25 | 3.23 |
| 44456.260416666664 | 3.3 |
| 44456.270833333336 | 3.4 |
| 44456.28125 | 3.68 |
| 44456.291666666664 | 3.78 |
| 44456.302083333336 | 4.11 |
| 44456.3125 | 4.1 |
| 44456.322916666664 | 4.15 |
| 44456.333333333336 | 4.15 |
| 44456.34375 | 4.27 |
| 44456.354166666664 | 4.35 |
| 44456.364583333336 | 4.34 |
| 44456.375 | 4.35 |
| 44456.385416666664 | 4.45 |
| 44456.395833333336 | 4.13 |
| 44456.40625 | 4.06 |
| 44456.416666666664 | 4.05 |
| 44456.427083333336 | 4.16 |
| 44456.4375 | 4.06 |
| 44456.447916666664 | 4.64 |
| 44456.458333333336 | 4.84 |
| 44456.46875 | 4.8 |
| 44456.479166666664 | 4.63 |
| 44456.489583333336 | 4.62 |
| 44456.5 | 4.69 |
| 44456.510416666664 | 4.68 |
| 44456.520833333336 | 4.72 |
| 44456.53125 | 4.53 |
| 44456.541666666664 | 4.42 |
| 44456.552083333336 | 4.43 |
| 44456.5625 | 4.5 |
| 44456.572916666664 | 4.38 |
| 44456.583333333336 | 4.41 |
| 44456.59375 | 4.49 |
| 44456.604166666664 | 4.73 |
| 44456.614583333336 | 4.98 |
| 44456.625 | 5.11 |
| 44456.635416666664 | 5.22 |
| 44456.645833333336 | 5.34 |
| 44456.65625 | 5.35 |
| 44456.666666666664 | 5.46 |
| 44456.677083333336 | 5.5 |
| 44456.6875 | 5.52 |
| 44456.697916666664 | 5.54 |
| 44456.708333333336 | 5.4 |
| 44456.71875 | 5.41 |
| 44456.729166666664 | 5.44 |
| 44456.739583333336 | 5.51 |
| 44456.75 | 5.55 |
| 44456.760416666664 | 5.56 |
| 44456.770833333336 | 5.73 |
| 44456.78125 | 5.96 |
| 44456.791666666664 | 6.21 |
| 44456.802083333336 | 6.78 |
| 44456.8125 | 7.03 |
| 44456.822916666664 | 7.08 |
| 44456.833333333336 | 7.19 |
| 44456.84375 | 7.41 |
| 44456.854166666664 | 7.6 |
| 44456.864583333336 | 7.65 |
| 44456.875 | 7.72 |
| 44456.885416666664 | 7.67 |
| 44456.895833333336 | 7.55 |
| 44456.90625 | 7.47 |
| 44456.916666666664 | 7.4 |
| 44456.927083333336 | 7.34 |
| 44456.9375 | 7.28 |
| 44456.947916666664 | 7.18 |
| 44456.958333333336 | 7.07 |
| 44456.96875 | 6.44 |
| 44456.979166666664 | 6.69 |
| 44456.989583333336 | 5.84 |
| 44457.0 | 6.24 |
| 44457.010416666664 | 5.64 |
| 44457.020833333336 | 5.82 |
| 44457.03125 | 6.29 |
| 44457.041666666664 | 6.15 |
| 44457.052083333336 | 5.1 |
| 44457.0625 | 4.01 |
| 44457.072916666664 | 4.85 |
| 44457.083333333336 | 5.75 |
| 44457.09375 | 4.69 |
| 44457.104166666664 | 5.41 |
| 44457.114583333336 | 4.15 |
| 44457.125 | 4.82 |
| 44457.135416666664 | 3.8 |
| 44457.145833333336 | 3.09 |
| 44457.15625 | 4.29 |
| 44457.166666666664 | 4.64 |
| 44457.177083333336 | 4.6 |
| 44457.1875 | 4.93 |
| 44457.197916666664 | 2.98 |
| 44457.208333333336 | 2.45 |
| 44457.21875 | 5.01 |
| 44457.229166666664 | 4.81 |
| 44457.239583333336 | 4.81 |
| 44457.25 | 2.67 |
| 44457.260416666664 | 1.68 |
| 44457.270833333336 | 3.02 |
| 44457.28125 | 3.53 |
| 44457.291666666664 | 3.74 |
| 44457.302083333336 | 3.8 |
| 44457.3125 | 3.82 |
| 44457.322916666664 | 4.04 |
| 44457.333333333336 | 4.22 |
| 44457.34375 | 4.26 |
| 44457.354166666664 | 4.34 |
| 44457.364583333336 | 4.28 |
| 44457.375 | 4.09 |
| 44457.385416666664 | 4.38 |
| 44457.395833333336 | 4.31 |
| 44457.40625 | 4.09 |
| 44457.416666666664 | 4.19 |
| 44457.427083333336 | 4.07 |
| 44457.4375 | 3.89 |
| 44457.447916666664 | 4.67 |
| 44457.458333333336 | 4.86 |
| 44457.46875 | 4.73 |
| 44457.479166666664 | 3.58 |
| 44457.489583333336 | 3.11 |
| 44457.5 | 3.28 |
| 44457.510416666664 | 3.31 |
| 44457.520833333336 | 3.49 |
| 44457.53125 | 3.69 |
| 44457.541666666664 | 3.35 |
| 44457.552083333336 | 4.32 |
| 44457.5625 | 4.24 |
| 44457.572916666664 | 3.63 |
| 44457.583333333336 | 3.63 |
| 44457.59375 | 3.47 |
| 44457.604166666664 | 3.97 |
| 44457.614583333336 | 3.95 |
| 44457.625 | 4.46 |
| 44457.635416666664 | 4.77 |
| 44457.645833333336 | 4.92 |
| 44457.65625 | 4.75 |
| 44457.666666666664 | 4.97 |
| 44457.677083333336 | 4.88 |
| 44457.6875 | 4.92 |
| 44457.697916666664 | 5.09 |
| 44457.708333333336 | 5 |
| 44457.71875 | 4.95 |
| 44457.729166666664 | 5.13 |
| 44457.739583333336 | 5.38 |
| 44457.75 | 5.06 |
| 44457.760416666664 | 5.09 |
| 44457.770833333336 | 5.07 |
| 44457.78125 | 5.07 |
| 44457.791666666664 | 5.05 |
| 44457.802083333336 | 5.32 |
| 44457.8125 | 5.72 |
| 44457.822916666664 | 6.03 |
| 44457.833333333336 | 6.19 |
| 44457.84375 | 6.5 |
| 44457.854166666664 | 6.78 |
| 44457.864583333336 | 7.06 |
| 44457.875 | 7.39 |
| 44457.885416666664 | 7.48 |
| 44457.895833333336 | 7.57 |
| 44457.90625 | 7.66 |
| 44457.916666666664 | 7.66 |
| 44457.927083333336 | 7.61 |
| 44457.9375 | 7.59 |
| 44457.947916666664 | 7.4 |
| 44457.958333333336 | 7.29 |
| 44457.96875 | 7.06 |
| 44457.979166666664 | 6.68 |
| 44457.989583333336 | 6.3 |
| 44458.0 | 6.04 |
| 44458.010416666664 | 5.87 |
| 44458.020833333336 | 6.27 |
| 44458.03125 | 6.58 |
| 44458.041666666664 | 6.63 |
| 44458.052083333336 | 6.51 |
| 44458.0625 | 6.48 |
| 44458.072916666664 | 6.48 |
| 44458.083333333336 | 6.41 |
| 44458.09375 | 6.22 |
| 44458.104166666664 | 6.02 |
| 44458.114583333336 | 5.85 |
| 44458.125 | 5.56 |
| 44458.135416666664 | 5.44 |
| 44458.145833333336 | 5.01 |
| 44458.15625 | 4.93 |
| 44458.166666666664 | 4.86 |
| 44458.177083333336 | 4.63 |
| 44458.1875 | 4.71 |
| 44458.197916666664 | 4.89 |
| 44458.208333333336 | 4.82 |
| 44458.21875 | 4.84 |
| 44458.229166666664 | 4.75 |
| 44458.239583333336 | 4.72 |
| 44458.25 | 4.66 |
| 44458.260416666664 | 4.59 |
| 44458.270833333336 | 4.43 |
| 44458.28125 | 4.22 |
| 44458.291666666664 | 2.89 |
| 44458.302083333336 | 3.77 |
| 44458.3125 | 3.95 |
| 44458.322916666664 | 3.93 |
| 44458.333333333336 | 4.15 |
| 44458.34375 | 4.17 |
| 44458.354166666664 | 4.39 |
| 44458.364583333336 | 4.43 |
| 44458.375 | 4.47 |
| 44458.385416666664 | 4.58 |
| 44458.395833333336 | 4.86 |
| 44458.40625 | 4.62 |
| 44458.416666666664 | 4.7 |
| 44458.427083333336 | 4.63 |
| 44458.4375 | 4.63 |
| 44458.447916666664 | 4.66 |
| 44458.458333333336 | 4.7 |
| 44458.46875 | 4.83 |
| 44458.479166666664 | 4.88 |
| 44458.489583333336 | 4.91 |
| 44458.5 | 4.72 |
| 44458.510416666664 | 4.63 |
| 44458.520833333336 | 4.7 |
| 44458.53125 | 4.74 |
| 44458.541666666664 | 4.88 |
| 44458.552083333336 | 4.99 |
| 44458.5625 | 4.85 |
| 44458.572916666664 | 4.69 |
| 44458.583333333336 | 4.77 |
| 44458.59375 | 4.67 |
| 44458.604166666664 | 4.92 |
| 44458.614583333336 | 4.96 |
| 44458.625 | 5.03 |
| 44458.635416666664 | 5.19 |
| 44458.645833333336 | 5.35 |
| 44458.65625 | 5.44 |
| 44458.666666666664 | 5.55 |
| 44458.677083333336 | 5.66 |
| 44458.6875 | 5.73 |
| 44458.697916666664 | 5.77 |
| 44458.708333333336 | 5.81 |
| 44458.71875 | 5.85 |
| 44458.729166666664 | 5.99 |
| 44458.739583333336 | 6.19 |
| 44458.75 | 6.21 |
| 44458.760416666664 | 6.25 |
| 44458.770833333336 | 6.08 |
| 44458.78125 | 6.18 |
| 44458.791666666664 | 5.91 |
| 44458.802083333336 | 5.8 |
| 44458.8125 | 5.77 |
| 44458.822916666664 | 5.82 |
| 44458.833333333336 | 6.01 |
| 44458.84375 | 6.27 |
| 44458.854166666664 | 6.61 |
| 44458.864583333336 | 7.16 |
| 44458.875 | 7.27 |
| 44458.885416666664 | 7.48 |
| 44458.895833333336 | 7.71 |
| 44458.90625 | 8.12 |
| 44458.916666666664 | 8.16 |
| 44458.927083333336 | 8.12 |
| 44458.9375 | 8.15 |
| 44458.947916666664 | 8.12 |
| 44458.958333333336 | 7.94 |
| 44458.96875 | 7.59 |
| 44458.979166666664 | 7.55 |
| 44458.989583333336 | 7.39 |
| 44459.0 | 7.32 |
| 44459.010416666664 | 7.18 |
| 44459.020833333336 | 7.04 |
| 44459.03125 | 6.89 |
| 44459.041666666664 | 6.75 |
| 44459.052083333336 | 6.74 |
| 44459.0625 | 6.76 |
| 44459.072916666664 | 6.91 |
| 44459.083333333336 | 6.86 |
| 44459.09375 | 6.85 |
| 44459.104166666664 | 6.76 |
| 44459.114583333336 | 6.63 |
| 44459.125 | 6.59 |
| 44459.135416666664 | 6.31 |
| 44459.145833333336 | 6.26 |
| 44459.15625 | 6.19 |
| 44459.166666666664 | 6.02 |
| 44459.177083333336 | 5.95 |
| 44459.1875 | 5.66 |
| 44459.197916666664 | 5.9 |
| 44459.208333333336 | 5.8 |
| 44459.21875 | 5.63 |
| 44459.229166666664 | 5.47 |
| 44459.239583333336 | 5.41 |
| 44459.25 | 5.29 |
| 44459.260416666664 | 5.21 |
| 44459.270833333336 | 5.09 |
| 44459.28125 | 4.97 |
| 44459.291666666664 | 4.88 |
| 44459.302083333336 | 4.81 |
| 44459.3125 | 4.07 |
| 44459.322916666664 | 4.24 |
| 44459.333333333336 | 4.58 |
| 44459.34375 | 4.67 |
| 44459.354166666664 | 4.74 |
| 44459.364583333336 | 4.79 |
| 44459.375 | 4.95 |
| 44459.385416666664 | 4.98 |
| 44459.395833333336 | 5.06 |
| 44459.40625 | 5.04 |
| 44459.416666666664 | 5.1 |
| 44459.427083333336 | 5.14 |
| 44459.4375 | 5.09 |
| 44459.447916666664 | 5.13 |
| 44459.458333333336 | 5.18 |
| 44459.46875 | 5.17 |
| 44459.479166666664 | 5.14 |
| 44459.489583333336 | 5.15 |
| 44459.5 | 5.24 |
| 44459.510416666664 | 5.3 |
| 44459.520833333336 | 5.27 |
| 44459.53125 | 5.29 |
| 44459.541666666664 | 5.36 |
| 44459.552083333336 | 5.38 |
| 44459.5625 | 5.13 |
| 44459.572916666664 | 5.47 |
| 44459.583333333336 | 5.57 |
| 44459.59375 | 5.66 |
| 44459.604166666664 | 5.66 |
| 44459.614583333336 | 5.66 |
| 44459.625 | 5.68 |
| 44459.635416666664 | 5.79 |
| 44459.645833333336 | 5.82 |
| 44459.65625 | 5.89 |
| 44459.666666666664 | 6.12 |
| 44459.677083333336 | 6.23 |
| 44459.6875 | 6.28 |
| 44459.697916666664 | 6.4 |
| 44459.708333333336 | 6.46 |
| 44459.71875 | 6.54 |
| 44459.729166666664 | 6.58 |
| 44459.739583333336 | 6.61 |
| 44459.75 | 6.65 |
| 44459.760416666664 | 6.65 |
| 44459.770833333336 | 6.59 |
| 44459.78125 | 6.59 |
| 44459.791666666664 | 6.61 |
| 44459.802083333336 | 6.56 |
| 44459.8125 | 6.33 |
| 44459.822916666664 | 6.4 |
| 44459.833333333336 | 6.34 |
| 44459.84375 | 6.44 |
| 44459.854166666664 | 6.38 |
| 44459.864583333336 | 6.42 |
| 44459.875 | 6.43 |
| 44459.885416666664 | 6.55 |
| 44459.895833333336 | 6.98 |
| 44459.90625 | 7.07 |
| 44459.916666666664 | 6.93 |
| 44459.927083333336 | 7.04 |
| 44459.9375 | 7.13 |
| 44459.947916666664 | 7.27 |
| 44459.958333333336 | 7.3 |
| 44459.96875 | 7.19 |
| 44459.979166666664 | 7.34 |
| 44459.989583333336 | 7.22 |
| 44460.0 | 7.11 |
| 44460.010416666664 | 6.97 |
| 44460.020833333336 | 6.86 |
| 44460.03125 | 6.7 |
| 44460.041666666664 | 6.79 |
| 44460.052083333336 | 6.61 |
| 44460.0625 | 6.67 |
| 44460.072916666664 | 6.36 |
| 44460.083333333336 | 6.62 |
| 44460.09375 | 6.68 |
| 44460.104166666664 | 6.71 |
| 44460.114583333336 | 6.65 |
| 44460.125 | 6.63 |
| 44460.135416666664 | 6.5 |
| 44460.145833333336 | 6.5 |
| 44460.15625 | 6.33 |
| 44460.166666666664 | 6.23 |
| 44460.177083333336 | 6.08 |
| 44460.1875 | 5.91 |
| 44460.197916666664 | 6.03 |
| 44460.208333333336 | 5.89 |
| 44460.21875 | 5.87 |
| 44460.229166666664 | 5.8 |
| 44460.239583333336 | 5.6 |
| 44460.25 | 5.59 |
| 44460.260416666664 | 5.66 |
| 44460.270833333336 | 5.58 |
| 44460.28125 | 5.58 |
| 44460.291666666664 | 5.56 |
| 44460.302083333336 | 5.51 |
| 44460.3125 | 5.45 |
| 44460.322916666664 | 5.42 |
| 44460.333333333336 | 5.3 |
| 44460.34375 | 5.26 |
| 44460.354166666664 | 4.16 |
| 44460.364583333336 | 4.94 |
| 44460.375 | 5.02 |
| 44460.385416666664 | 4.95 |
| 44460.395833333336 | 4.98 |
| 44460.40625 | 5.07 |
| 44460.416666666664 | 5.15 |
| 44460.427083333336 | 5.19 |
| 44460.4375 | 5.19 |
| 44460.447916666664 | 5.3 |
| 44460.458333333336 | 5.39 |
| 44460.46875 | 5.32 |
| 44460.479166666664 | 5.38 |
| 44460.489583333336 | 5.41 |
| 44460.5 | 5.45 |
| 44460.510416666664 | 5.41 |
| 44460.520833333336 | 5.52 |
| 44460.53125 | 5.61 |
| 44460.541666666664 | 5.75 |
| 44460.552083333336 | 5.79 |
| 44460.5625 | 5.85 |
| 44460.572916666664 | 5.84 |
| 44460.583333333336 | 5.91 |
| 44460.59375 | 5.95 |
| 44460.604166666664 | 5.99 |
| 44460.614583333336 | 6.07 |
| 44460.625 | 6.18 |
| 44460.635416666664 | 6.14 |
| 44460.645833333336 | 6.21 |
| 44460.65625 | 6.23 |
| 44460.666666666664 | 6.32 |
| 44460.677083333336 | 6.28 |
| 44460.6875 | 6.49 |
| 44460.697916666664 | 6.48 |
| 44460.708333333336 | 6.59 |
| 44460.71875 | 6.69 |
| 44460.729166666664 | 6.72 |
| 44460.739583333336 | 6.8 |
| 44460.75 | 6.84 |
| 44460.760416666664 | 6.92 |
| 44460.770833333336 | 7.01 |
| 44460.78125 | 7.08 |
| 44460.791666666664 | 7.09 |
| 44460.802083333336 | 7.15 |
| 44460.8125 | 7.15 |
| 44460.822916666664 | 7.18 |
| 44460.833333333336 | 7.24 |
| 44460.84375 | 7.11 |
| 44460.854166666664 | 6.93 |
| 44460.864583333336 | 6.91 |
| 44460.875 | 6.88 |
| 44460.885416666664 | 6.73 |
| 44460.895833333336 | 6.66 |
| 44460.90625 | 6.63 |
| 44460.916666666664 | 6.85 |
| 44460.927083333336 | 7.18 |
| 44460.9375 | 7.08 |
| 44460.947916666664 | 7 |
| 44460.958333333336 | 7.32 |
| 44460.96875 | 7.36 |
| 44460.979166666664 | 7.35 |
| 44460.989583333336 | 7.21 |
| 44461.0 | 7.05 |
| 44461.010416666664 | 7 |
| 44461.020833333336 | 6.92 |
| 44461.03125 | 6.78 |
| 44461.041666666664 | 6.66 |
| 44461.052083333336 | 6.58 |
| 44461.0625 | 6.32 |
| 44461.072916666664 | 6.25 |
| 44461.083333333336 | 6.21 |
| 44461.09375 | 6.19 |
| 44461.104166666664 | 6.17 |
| 44461.114583333336 | 6.25 |
| 44461.125 | 6.55 |
| 44461.135416666664 | 6.48 |
| 44461.145833333336 | 6.63 |
| 44461.15625 | 6.51 |
| 44461.166666666664 | 6.32 |
| 44461.177083333336 | 6.16 |
| 44461.1875 | 6.11 |
| 44461.197916666664 | 6.03 |
| 44461.208333333336 | 5.66 |
| 44461.21875 | 5.61 |
| 44461.229166666664 | 5.69 |
| 44461.239583333336 | 5.49 |
| 44461.25 | 5.53 |
| 44461.260416666664 | 5.61 |
| 44461.270833333336 | 5.54 |
| 44461.28125 | 5.52 |
| 44461.291666666664 | 5.43 |
| 44461.302083333336 | 5.42 |
| 44461.3125 | 5.43 |
| 44461.322916666664 | 5.42 |
| 44461.333333333336 | 5.4 |
| 44461.34375 | 5.38 |
| 44461.354166666664 | 5.11 |
| 44461.364583333336 | 2.8 |
| 44461.375 | 3.94 |
| 44461.385416666664 | 4.48 |
| 44461.395833333336 | 4.56 |
| 44461.40625 | 4.77 |
| 44461.416666666664 | 4.68 |
| 44461.427083333336 | 5.14 |
| 44461.4375 | 5.04 |
| 44461.447916666664 | 4.97 |
| 44461.458333333336 | 5 |
| 44461.46875 | 5.08 |
| 44461.479166666664 | 5.26 |
| 44461.489583333336 | 5.09 |
| 44461.5 | 5.3 |
| 44461.510416666664 | 5.29 |
| 44461.520833333336 | 5.3 |
| 44461.53125 | 5.36 |
| 44461.541666666664 | 5.46 |
| 44461.552083333336 | 5.64 |
| 44461.5625 | 5.61 |
| 44461.572916666664 | 5.83 |
| 44461.583333333336 | 5.86 |
| 44461.59375 | 5.84 |
| 44461.604166666664 | 5.8 |
| 44461.614583333336 | 5.84 |
| 44461.625 | 5.89 |
| 44461.635416666664 | 5.93 |
| 44461.645833333336 | 6.04 |
| 44461.65625 | 6.13 |
| 44461.666666666664 | 6.14 |
| 44461.677083333336 | 6.11 |
| 44461.6875 | 6.15 |
| 44461.697916666664 | 6.14 |
| 44461.708333333336 | 6.19 |
| 44461.71875 | 6.22 |
| 44461.729166666664 | 6.25 |
| 44461.739583333336 | 6.39 |
| 44461.75 | 6.41 |
| 44461.760416666664 | 6.41 |
| 44461.770833333336 | 6.4 |
| 44461.78125 | 6.48 |
| 44461.791666666664 | 6.55 |
| 44461.802083333336 | 6.58 |
| 44461.8125 | 6.61 |
| 44461.822916666664 | 6.6 |
| 44461.833333333336 | 6.59 |
| 44461.84375 | 6.61 |
| 44461.854166666664 | 6.56 |
| 44461.864583333336 | 6.53 |
| 44461.875 | 6.29 |
| 44461.885416666664 | 6.05 |
| 44461.895833333336 | 5.88 |
| 44461.90625 | 5.73 |
| 44461.916666666664 | 5.61 |
| 44461.927083333336 | 5.71 |
| 44461.9375 | 5.56 |
| 44461.947916666664 | 5.58 |
| 44461.958333333336 | 5.45 |
| 44461.96875 | 5.5 |
| 44461.979166666664 | 5.51 |
| 44461.989583333336 | 5.51 |
| 44462.0 | 5.68 |
| 44462.010416666664 | 5.39 |
| 44462.020833333336 | 5.45 |
| 44462.03125 | 5.59 |
| 44462.041666666664 | 5.5 |
| 44462.052083333336 | 5.67 |
| 44462.0625 | 5.54 |
| 44462.072916666664 | 6 |
| 44462.083333333336 | 5.7 |
| 44462.09375 | 5.99 |
| 44462.104166666664 | 5.61 |
| 44462.114583333336 | 6.1 |
| 44462.125 | 5.72 |
| 44462.135416666664 | 5.85 |
| 44462.145833333336 | 5.62 |
| 44462.15625 | 5.7 |
| 44462.166666666664 | 6.04 |
| 44462.177083333336 | 6.08 |
| 44462.1875 | 5.85 |
| 44462.197916666664 | 5.62 |
| 44462.208333333336 | 5.56 |
| 44462.21875 | 5.39 |
| 44462.229166666664 | 5.43 |
| 44462.239583333336 | 5.29 |
| 44462.25 | 5.41 |
| 44462.260416666664 | 5.44 |
| 44462.270833333336 | 5.39 |
| 44462.28125 | 5.39 |
| 44462.291666666664 | 5.46 |
| 44462.302083333336 | 5.44 |
| 44462.3125 | 5.44 |
| 44462.322916666664 | 5.45 |
| 44462.333333333336 | 5.45 |
| 44462.34375 | 5.43 |
| 44462.354166666664 | 5.44 |
| 44462.364583333336 | 5.39 |
| 44462.375 | 2.91 |
| 44462.385416666664 | 3.85 |
| 44462.395833333336 | 4.26 |
| 44462.40625 | 4.45 |
| 44462.416666666664 | 4.77 |
| 44462.427083333336 | 4.84 |
| 44462.4375 | 5.04 |
| 44462.447916666664 | 4.89 |
| 44462.458333333336 | 5.16 |
| 44462.46875 | 5.23 |
| 44462.479166666664 | 5.12 |
| 44462.489583333336 | 5.25 |
| 44462.5 | 5.32 |
| 44462.510416666664 | 5.66 |
| 44462.520833333336 | 5.7 |
| 44462.53125 | 5.62 |
| 44462.541666666664 | 5.72 |
| 44462.552083333336 | 5.76 |
| 44462.5625 | 5.78 |
| 44462.572916666664 | 5.75 |
| 44462.583333333336 | 5.8 |
| 44462.59375 | 5.84 |
| 44462.604166666664 | 5.76 |
| 44462.614583333336 | 5.8 |
| 44462.625 | 5.74 |
| 44462.635416666664 | 5.89 |
| 44462.645833333336 | 5.9 |
| 44462.65625 | 5.72 |
| 44462.666666666664 | 5.68 |
| 44462.677083333336 | 5.96 |
| 44462.6875 | 6 |
| 44462.697916666664 | 5.86 |
| 44462.708333333336 | 5.84 |
| 44462.71875 | 5.86 |
| 44462.729166666664 | 5.82 |
| 44462.739583333336 | 5.88 |
| 44462.75 | 5.83 |
| 44462.760416666664 | 5.77 |
| 44462.770833333336 | 5.65 |
| 44462.78125 | 5.64 |
| 44462.791666666664 | 5.65 |
| 44462.802083333336 | 5.63 |
| 44462.8125 | 5.68 |
| 44462.822916666664 | 5.61 |
| 44462.833333333336 | 5.62 |
| 44462.84375 | 5.56 |
| 44462.854166666664 | 5.55 |
| 44462.864583333336 | 5.37 |
| 44462.875 | 5.12 |
| 44462.885416666664 | 5.03 |
| 44462.895833333336 | 5.11 |
| 44462.90625 | 4.58 |
| 44462.916666666664 | 4.67 |
| 44462.927083333336 | 4.77 |
| 44462.9375 | 4.81 |
| 44462.947916666664 | 4.8 |
| 44462.958333333336 | 4.9 |
| 44462.96875 | 4.9 |
| 44462.979166666664 | 4.87 |
| 44462.989583333336 | 4.99 |
| 44463.0 | 4.87 |
| 44463.010416666664 | 4.88 |
| 44463.020833333336 | 4.89 |
| 44463.03125 | 4.8 |
| 44463.041666666664 | 4.72 |
| 44463.052083333336 | 4.73 |
| 44463.0625 | 4.66 |
| 44463.072916666664 | 4.7 |
| 44463.083333333336 | 4.69 |
| 44463.09375 | 4.67 |
| 44463.104166666664 | 4.77 |
| 44463.114583333336 | 4.46 |
| 44463.125 | 4.33 |
| 44463.135416666664 | 4.39 |
| 44463.145833333336 | 4.44 |
| 44463.15625 | 4.42 |
| 44463.166666666664 | 4.49 |
| 44463.177083333336 | 4.77 |
| 44463.1875 | 4.62 |
| 44463.197916666664 | 4.98 |
| 44463.208333333336 | 4.48 |
| 44463.21875 | 4.36 |
| 44463.229166666664 | 4.33 |
| 44463.239583333336 | 4.33 |
| 44463.25 | 4.1 |
| 44463.260416666664 | 3.96 |
| 44463.270833333336 | 3.84 |
| 44463.28125 | 3.83 |
| 44463.291666666664 | 4.06 |
| 44463.302083333336 | 3.96 |
| 44463.3125 | 4.12 |
| 44463.322916666664 | 4.28 |
| 44463.333333333336 | 4.47 |
| 44463.34375 | 4.44 |
| 44463.354166666664 | 4.5 |
| 44463.364583333336 | 4.49 |
| 44463.375 | 4.51 |
| 44463.385416666664 | 4.56 |
| 44463.395833333336 | 4.55 |
| 44463.40625 | 1.88 |
| 44463.416666666664 | 1.39 |
| 44463.427083333336 | 2.42 |
| 44463.4375 | 3.32 |
| 44463.447916666664 | 3.82 |
| 44463.458333333336 | 4.11 |
| 44463.46875 | 4.2 |
| 44463.479166666664 | 4.39 |
| 44463.489583333336 | 4.6 |
| 44463.5 | 4.67 |
| 44463.510416666664 | 4.78 |
| 44463.520833333336 | 4.81 |
| 44463.53125 | 4.89 |
| 44463.541666666664 | 5 |
| 44463.552083333336 | 5.05 |
| 44463.5625 | 5.11 |
| 44463.572916666664 | 5.18 |
| 44463.583333333336 | 5.27 |
| 44463.59375 | 5.34 |
| 44463.604166666664 | 5.4 |
| 44463.614583333336 | 5.44 |
| 44463.625 | 5.49 |
| 44463.635416666664 | 5.61 |
| 44463.645833333336 | 5.65 |
| 44463.65625 | 5.61 |
| 44463.666666666664 | 5.73 |
| 44463.677083333336 | 5.75 |
| 44463.6875 | 5.79 |
| 44463.697916666664 | 5.92 |
| 44463.708333333336 | 6 |
| 44463.71875 | 6.09 |
| 44463.729166666664 | 6.18 |
| 44463.739583333336 | 6.19 |
| 44463.75 | 6.24 |
| 44463.760416666664 | 6.24 |
| 44463.770833333336 | 6.28 |
| 44463.78125 | 6.37 |
| 44463.791666666664 | 6.48 |
| 44463.802083333336 | 6.6 |
| 44463.8125 | 6.6 |
| 44463.822916666664 | 6.71 |
| 44463.833333333336 | 6.79 |
| 44463.84375 | 6.8 |
| 44463.854166666664 | 6.82 |
| 44463.864583333336 | 6.83 |
| 44463.875 | 6.83 |
| 44463.885416666664 | 6.82 |
| 44463.895833333336 | 6.84 |
| 44463.90625 | 6.84 |
| 44463.916666666664 | 6.91 |
| 44463.927083333336 | 6.9 |
| 44463.9375 | 6.29 |
| 44463.947916666664 | 5.76 |
| 44463.958333333336 | 5.29 |
| 44463.96875 | 5.64 |
| 44463.979166666664 | 6.04 |
| 44463.989583333336 | 6 |
| 44464.0 | 5.77 |
| 44464.010416666664 | 5.73 |
| 44464.020833333336 | 6.16 |
| 44464.03125 | 6.09 |
| 44464.041666666664 | 6.01 |
| 44464.052083333336 | 5.84 |
| 44464.0625 | 5.67 |
| 44464.072916666664 | 5.49 |
| 44464.083333333336 | 5.46 |
| 44464.09375 | 5.33 |
| 44464.104166666664 | 5.3 |
| 44464.114583333336 | 5.17 |
| 44464.125 | 5.09 |
| 44464.135416666664 | 4.93 |
| 44464.145833333336 | 5.01 |
| 44464.15625 | 4.71 |
| 44464.166666666664 | 4.75 |
| 44464.177083333336 | 4.97 |
| 44464.1875 | 5.23 |
| 44464.197916666664 | 5.29 |
| 44464.208333333336 | 5.36 |
| 44464.21875 | 5.54 |
| 44464.229166666664 | 5.75 |
| 44464.239583333336 | 5.52 |
| 44464.25 | 5.57 |
| 44464.260416666664 | 5.72 |
| 44464.270833333336 | 5.32 |
| 44464.28125 | 5.34 |
| 44464.291666666664 | 5.35 |
| 44464.302083333336 | 5.17 |
| 44464.3125 | 5.49 |
| 44464.322916666664 | 5.4 |
| 44464.333333333336 | 5.61 |
| 44464.34375 | 5.4 |
| 44464.354166666664 | 5.5 |
| 44464.364583333336 | 5.53 |
| 44464.375 | 5.49 |
| 44464.385416666664 | 5.5 |
| 44464.395833333336 | 5.54 |
| 44464.40625 | 5.51 |
| 44464.416666666664 | 5.5 |
| 44464.427083333336 | 3.34 |
| 44464.4375 | 2.3 |
| 44464.447916666664 | 3.39 |
| 44464.458333333336 | 4.65 |
| 44464.46875 | 4.9 |
| 44464.479166666664 | 4.93 |
| 44464.489583333336 | 4.84 |
| 44464.5 | 4.99 |
| 44464.510416666664 | 5.18 |
| 44464.520833333336 | 5.23 |
| 44464.53125 | 5.25 |
| 44464.541666666664 | 5.25 |
| 44464.552083333336 | 5.26 |
| 44464.5625 | 5.29 |
| 44464.572916666664 | 5.3 |
| 44464.583333333336 | 5.32 |
| 44464.59375 | 5.36 |
| 44464.604166666664 | 5.46 |
| 44464.614583333336 | 5.54 |
| 44464.625 | 5.72 |
| 44464.635416666664 | 5.77 |
| 44464.645833333336 | 5.86 |
| 44464.65625 | 6.01 |
| 44464.666666666664 | 6.1 |
| 44464.677083333336 | 6.16 |
| 44464.6875 | 6.22 |
| 44464.697916666664 | 6.24 |
| 44464.708333333336 | 6.22 |
| 44464.71875 | 6.36 |
| 44464.729166666664 | 6.45 |
| 44464.739583333336 | 6.5 |
| 44464.75 | 6.54 |
| 44464.760416666664 | 6.52 |
| 44464.770833333336 | 6.41 |
| 44464.78125 | 6.5 |
| 44464.791666666664 | 6.54 |
| 44464.802083333336 | 6.54 |
| 44464.8125 | 6.73 |
| 44464.822916666664 | 6.75 |
| 44464.833333333336 | 6.83 |
| 44464.84375 | 6.88 |
| 44464.854166666664 | 6.91 |
| 44464.864583333336 | 6.93 |
| 44464.875 | 6.91 |
| 44464.885416666664 | 6.96 |
| 44464.895833333336 | 7.05 |
| 44464.90625 | 7.04 |
| 44464.916666666664 | 7.03 |
| 44464.927083333336 | 7.12 |
| 44464.9375 | 7.07 |
| 44464.947916666664 | 7.12 |
| 44464.958333333336 | 6.57 |
| 44464.96875 | 5.76 |
| 44464.979166666664 | 6.03 |
| 44464.989583333336 | 6.24 |
| 44465.0 | 5.81 |
| 44465.010416666664 | 5.71 |
| 44465.020833333336 | 5.41 |
| 44465.03125 | 5.09 |
| 44465.041666666664 | 5.63 |
| 44465.052083333336 | 5.77 |
| 44465.0625 | 5.96 |
| 44465.072916666664 | 5.79 |
| 44465.083333333336 | 5.62 |
| 44465.09375 | 5.46 |
| 44465.104166666664 | 5.45 |
| 44465.114583333336 | 5.5 |
| 44465.125 | 5.34 |
| 44465.135416666664 | 5.44 |
| 44465.145833333336 | 5.44 |
| 44465.15625 | 5.21 |
| 44465.166666666664 | 5.09 |
| 44465.177083333336 | 5.28 |
| 44465.1875 | 5.1 |
| 44465.197916666664 | 4.88 |
| 44465.208333333336 | 5.12 |
| 44465.21875 | 5.38 |
| 44465.229166666664 | 5.74 |
| 44465.239583333336 | 5.43 |
| 44465.25 | 5.63 |
| 44465.260416666664 | 5.62 |
| 44465.270833333336 | 5.49 |
| 44465.28125 | 5.92 |
| 44465.291666666664 | 5.68 |
| 44465.302083333336 | 5.51 |
| 44465.3125 | 5.6 |
| 44465.322916666664 | 5.86 |
| 44465.333333333336 | 5.78 |
| 44465.34375 | 5.86 |
| 44465.354166666664 | 5.67 |
| 44465.364583333336 | 5.63 |
| 44465.375 | 5.61 |
| 44465.385416666664 | 5.52 |
| 44465.395833333336 | 5.66 |
| 44465.40625 | 5.77 |
| 44465.416666666664 | 5.77 |
| 44465.427083333336 | 5.74 |
| 44465.4375 | 5.67 |
| 44465.447916666664 | 5.34 |
| 44465.458333333336 | 4.63 |
| 44465.46875 | 3.11 |
| 44465.479166666664 | 3.93 |
| 44465.489583333336 | 4.81 |
| 44465.5 | 4.91 |
| 44465.510416666664 | 5.02 |
| 44465.520833333336 | 5.02 |
| 44465.53125 | 5.04 |
| 44465.541666666664 | 5.21 |
| 44465.552083333336 | 5.43 |
| 44465.5625 | 5.48 |
| 44465.572916666664 | 5.51 |
| 44465.583333333336 | 5.56 |
| 44465.59375 | 5.6 |
| 44465.604166666664 | 5.65 |
| 44465.614583333336 | 5.77 |
| 44465.625 | 5.78 |
| 44465.635416666664 | 5.9 |
| 44465.645833333336 | 5.96 |
| 44465.65625 | 6.07 |
| 44465.666666666664 | 6.22 |
| 44465.677083333336 | 6.34 |
| 44465.6875 | 6.38 |
| 44465.697916666664 | 6.55 |
| 44465.708333333336 | 6.62 |
| 44465.71875 | 6.71 |
| 44465.729166666664 | 6.09 |
| 44465.739583333336 | 6.68 |
| 44465.75 | 6.73 |
| 44465.760416666664 | 6.76 |
| 44465.770833333336 | 6.92 |
| 44465.78125 | 6.9 |
| 44465.791666666664 | 6.95 |
| 44465.802083333336 | 7.02 |
| 44465.8125 | 7.11 |
| 44465.822916666664 | 7.1 |
| 44465.833333333336 | 7.15 |
| 44465.84375 | 7.28 |
| 44465.854166666664 | 7.32 |
| 44465.864583333336 | 7.21 |
| 44465.875 | 7.25 |
| 44465.885416666664 | 7.22 |
| 44465.895833333336 | 7.25 |
| 44465.90625 | 7.31 |
| 44465.916666666664 | 7.31 |
| 44465.927083333336 | 7.37 |
| 44465.9375 | 7.49 |
| 44465.947916666664 | 7.53 |
| 44465.958333333336 | 7.52 |
| 44465.96875 | 7.46 |
| 44465.979166666664 | 7.45 |
| 44465.989583333336 | 7.41 |
| 44466.0 | 6.65 |
| 44466.010416666664 | 5.46 |
| 44466.020833333336 | 4.19 |
| 44466.03125 | 5.13 |
| 44466.041666666664 | 5.13 |
| 44466.052083333336 | 5.38 |
| 44466.0625 | 5.24 |
| 44466.072916666664 | 5.51 |
| 44466.083333333336 | 5.63 |
| 44466.09375 | 5.75 |
| 44466.104166666664 | 5.86 |
| 44466.114583333336 | 5.9 |
| 44466.125 | 5.72 |
| 44466.135416666664 | 5.67 |
| 44466.145833333336 | 5.76 |
| 44466.15625 | 5.57 |
| 44466.166666666664 | 5.47 |
| 44466.177083333336 | 5.32 |
| 44466.1875 | 5.39 |
| 44466.197916666664 | 4.98 |
| 44466.208333333336 | 5.14 |
| 44466.21875 | 5.07 |
| 44466.229166666664 | 5.32 |
| 44466.239583333336 | 5.65 |
| 44466.25 | 5.71 |
| 44466.260416666664 | 6.29 |
| 44466.270833333336 | 6.1 |
| 44466.28125 | 6 |
| 44466.291666666664 | 6.22 |
| 44466.302083333336 | 6.19 |
| 44466.3125 | 5.99 |
| 44466.322916666664 | 6.15 |
| 44466.333333333336 | 6.21 |
| 44466.34375 | 5.92 |
| 44466.354166666664 | 5.91 |
| 44466.364583333336 | 6 |
| 44466.375 | 5.87 |
| 44466.385416666664 | 5.82 |
| 44466.395833333336 | 5.93 |
| 44466.40625 | 5.85 |
| 44466.416666666664 | 5.83 |
| 44466.427083333336 | 5.91 |
| 44466.4375 | 5.87 |
| 44466.447916666664 | 5.87 |
| 44466.458333333336 | 5.8 |
| 44466.46875 | 5.76 |
| 44466.479166666664 | 5.71 |
| 44466.489583333336 | 5.65 |
| 44466.5 | 5.12 |
| 44466.510416666664 | 4.42 |
| 44466.520833333336 | 5.17 |
| 44466.53125 | 5.11 |
| 44466.541666666664 | 5.27 |
| 44466.552083333336 | 5.34 |
| 44466.5625 | 5.4 |
| 44466.572916666664 | 5.47 |
| 44466.583333333336 | 5.58 |
| 44466.59375 | 5.68 |
| 44466.604166666664 | 5.75 |
| 44466.614583333336 | 5.85 |
| 44466.625 | 5.92 |
| 44466.635416666664 | 6.04 |
| 44466.645833333336 | 6.12 |
| 44466.65625 | 6.26 |
| 44466.666666666664 | 6.35 |
| 44466.677083333336 | 6.5 |
| 44466.6875 | 6.63 |
| 44466.697916666664 | 6.76 |
| 44466.708333333336 | 6.77 |
| 44466.71875 | 6.93 |
| 44466.729166666664 | 6.99 |
| 44466.739583333336 | 7.02 |
| 44466.75 | 7.05 |
| 44466.760416666664 | 7.06 |
| 44466.770833333336 | 7.02 |
| 44466.78125 | 7.27 |
| 44466.791666666664 | 7.25 |
| 44466.802083333336 | 7.36 |
| 44466.8125 | 7.43 |
| 44466.822916666664 | 7.46 |
| 44466.833333333336 | 7.35 |
| 44466.84375 | 7.32 |
| 44466.854166666664 | 7.21 |
| 44466.864583333336 | 7.28 |
| 44466.875 | 7.25 |
| 44466.885416666664 | 7.19 |
| 44466.895833333336 | 7.16 |
| 44466.90625 | 7.2 |
| 44466.916666666664 | 7.16 |
| 44466.927083333336 | 7.22 |
| 44466.9375 | 7.23 |
| 44466.947916666664 | 7.19 |
| 44466.958333333336 | 7.21 |
| 44466.96875 | 7.26 |
| 44466.979166666664 | 7.28 |
| 44466.989583333336 | 7.28 |
| 44467.0 | 7.27 |
| 44467.010416666664 | 7.25 |
| 44467.020833333336 | 7.23 |
| 44467.03125 | 6.76 |
| 44467.041666666664 | 4.6 |
| 44467.052083333336 | 2.01 |
| 44467.0625 | 3.11 |
| 44467.072916666664 | 3.92 |
| 44467.083333333336 | 4.44 |
| 44467.09375 | 4.24 |
| 44467.104166666664 | 3.8 |
| 44467.114583333336 | 3.98 |
| 44467.125 | 4.1 |
| 44467.135416666664 | 4.62 |
| 44467.145833333336 | 4.59 |
| 44467.15625 | 4.68 |
| 44467.166666666664 | 5.02 |
| 44467.177083333336 | 4.98 |
| 44467.1875 | 4.91 |
| 44467.197916666664 | 4.89 |
| 44467.208333333336 | 4.68 |
| 44467.21875 | 4.19 |
| 44467.229166666664 | 4.19 |
| 44467.239583333336 | 4.99 |
| 44467.25 | 5.11 |
| 44467.260416666664 | 5.35 |
| 44467.270833333336 | 5.18 |
| 44467.28125 | 5.57 |
| 44467.291666666664 | 5.86 |
| 44467.302083333336 | 5.93 |
| 44467.3125 | 5.94 |
| 44467.322916666664 | 5.86 |
| 44467.333333333336 | 5.92 |
| 44467.34375 | 6.01 |
| 44467.354166666664 | 5.73 |
| 44467.364583333336 | 5.85 |
| 44467.375 | 6.1 |
| 44467.385416666664 | 6.08 |
| 44467.395833333336 | 5.91 |
| 44467.40625 | 5.87 |
| 44467.416666666664 | 6.02 |
| 44467.427083333336 | 6 |
| 44467.4375 | 5.92 |
| 44467.447916666664 | 5.78 |
| 44467.458333333336 | 5.76 |
| 44467.46875 | 5.77 |
| 44467.479166666664 | 5.78 |
| 44467.489583333336 | 5.67 |
| 44467.5 | 5.76 |
| 44467.510416666664 | 5.78 |
| 44467.520833333336 | 5.46 |
| 44467.53125 | 4.73 |
| 44467.541666666664 | 5.06 |
| 44467.552083333336 | 5.18 |
| 44467.5625 | 5.21 |
| 44467.572916666664 | 5.13 |
| 44467.583333333336 | 5.22 |
| 44467.59375 | 5.34 |
| 44467.604166666664 | 5.4 |
| 44467.614583333336 | 5.52 |
| 44467.625 | 5.68 |
| 44467.635416666664 | 5.9 |
| 44467.645833333336 | 6.01 |
| 44467.65625 | 6.12 |
| 44467.666666666664 | 6.26 |
| 44467.677083333336 | 6.4 |
| 44467.6875 | 6.67 |
| 44467.697916666664 | 6.81 |
| 44467.708333333336 | 6.87 |
| 44467.71875 | 6.97 |
| 44467.729166666664 | 7.03 |
| 44467.739583333336 | 7.13 |
| 44467.75 | 7.19 |
| 44467.760416666664 | 7.4 |
| 44467.770833333336 | 7.39 |
| 44467.78125 | 7.32 |
| 44467.791666666664 | 7.19 |
| 44467.802083333336 | 6.77 |
| 44467.8125 | 7.61 |
| 44467.822916666664 | 7.41 |
| 44467.833333333336 | 7.79 |
| 44467.84375 | 7.85 |
| 44467.854166666664 | 7.72 |
| 44467.864583333336 | 7.54 |
| 44467.875 | 7.44 |
| 44467.885416666664 | 7.28 |
| 44467.895833333336 | 7.2 |
| 44467.90625 | 7.08 |
| 44467.916666666664 | 7.04 |
| 44467.927083333336 | 6.82 |
| 44467.9375 | 6.88 |
| 44467.947916666664 | 6.91 |
| 44467.958333333336 | 6.97 |
| 44467.96875 | 6.88 |
| 44467.979166666664 | 6.93 |
| 44467.989583333336 | 6.95 |
| 44468.0 | 6.97 |
| 44468.010416666664 | 6.98 |
| 44468.020833333336 | 6.99 |
| 44468.03125 | 6.96 |
| 44468.041666666664 | 6.93 |
| 44468.052083333336 | 6.89 |
| 44468.0625 | 5.01 |
| 44468.072916666664 | 2.36 |
| 44468.083333333336 | 2.83 |
| 44468.09375 | 3.37 |
| 44468.104166666664 | 3.97 |
| 44468.114583333336 | 3.75 |
| 44468.125 | 3.77 |
| 44468.135416666664 | 4.11 |
| 44468.145833333336 | 4.41 |
| 44468.15625 | 4.41 |
| 44468.166666666664 | 4.74 |
| 44468.177083333336 | 5.05 |
| 44468.1875 | 5.3 |
| 44468.197916666664 | 5.15 |
| 44468.208333333336 | 5.19 |
| 44468.21875 | 4.76 |
| 44468.229166666664 | 5.05 |
| 44468.239583333336 | 4.87 |
| 44468.25 | 4.75 |
| 44468.260416666664 | 4.44 |
| 44468.270833333336 | 4.19 |
| 44468.28125 | 4.83 |
| 44468.291666666664 | 5.01 |
| 44468.302083333336 | 5.71 |
| 44468.3125 | 5.33 |
| 44468.322916666664 | 5.25 |
| 44468.333333333336 | 5.37 |
| 44468.34375 | 4.94 |
| 44468.354166666664 | 5.04 |
| 44468.364583333336 | 4.88 |
| 44468.375 | 4.89 |
| 44468.385416666664 | 5.07 |
| 44468.395833333336 | 4.88 |
| 44468.40625 | 5.3 |
| 44468.416666666664 | 4.99 |
| 44468.427083333336 | 5.21 |
| 44468.4375 | 5.45 |
| 44468.447916666664 | 5.11 |
| 44468.458333333336 | 5.07 |
| 44468.46875 | 5.27 |
| 44468.479166666664 | 5.18 |
| 44468.489583333336 | 5.37 |
| 44468.5 | 5.32 |
| 44468.510416666664 | 5.35 |
| 44468.520833333336 | 5.35 |
| 44468.53125 | 5.33 |
| 44468.541666666664 | 5.4 |
| 44468.552083333336 | 5.37 |
| 44468.5625 | 5 |
| 44468.572916666664 | 4.84 |
| 44468.583333333336 | 4.97 |
| 44468.59375 | 4.9 |
| 44468.604166666664 | 4.92 |
| 44468.614583333336 | 4.97 |
| 44468.625 | 5.15 |
| 44468.635416666664 | 5.26 |
| 44468.645833333336 | 5.56 |
| 44468.65625 | 5.76 |
| 44468.666666666664 | 5.99 |
| 44468.677083333336 | 6.07 |
| 44468.6875 | 6.26 |
| 44468.697916666664 | 6.39 |
| 44468.708333333336 | 6.51 |
| 44468.71875 | 6.58 |
| 44468.729166666664 | 6.68 |
| 44468.739583333336 | 6.75 |
| 44468.75 | 6.82 |
| 44468.760416666664 | 6.93 |
| 44468.770833333336 | 7 |
| 44468.78125 | 7.08 |
| 44468.791666666664 | 7.14 |
| 44468.802083333336 | 7.11 |
| 44468.8125 | 7.2 |
| 44468.822916666664 | 7.1 |
| 44468.833333333336 | 6.69 |
| 44468.84375 | 7 |
| 44468.854166666664 | 7.3 |
| 44468.864583333336 | 7.37 |
| 44468.875 | 7.43 |
| 44468.885416666664 | 7.45 |
| 44468.895833333336 | 7.42 |
| 44468.90625 | 7.35 |
| 44468.916666666664 | 7.33 |
| 44468.927083333336 | 7.23 |
| 44468.9375 | 7.19 |
| 44468.947916666664 | 6.82 |
| 44468.958333333336 | 6.75 |
| 44468.96875 | 6.74 |
| 44468.979166666664 | 6.68 |
| 44468.989583333336 | 6.68 |
| 44469.0 | 6.53 |
| 44469.010416666664 | 6.45 |
| 44469.020833333336 | 6.4 |
| 44469.03125 | 6.56 |
| 44469.041666666664 | 6.54 |
| 44469.052083333336 | 6.75 |
| 44469.0625 | 6.69 |
| 44469.072916666664 | 6.59 |
| 44469.083333333336 | 6.62 |
| 44469.09375 | 6.68 |
| 44469.104166666664 | 6.57 |
| 44469.114583333336 | 5.35 |
| 44469.125 | 3.43 |
| 44469.135416666664 | 3.95 |
| 44469.145833333336 | 4.87 |
| 44469.15625 | 5.12 |
| 44469.166666666664 | 5.14 |
| 44469.177083333336 | 5.07 |
| 44469.1875 | 5.23 |
| 44469.197916666664 | 5.25 |
| 44469.208333333336 | 5.07 |
| 44469.21875 | 5.08 |
| 44469.229166666664 | 5.18 |
| 44469.239583333336 | 5.24 |
| 44469.25 | 5.16 |
| 44469.260416666664 | 4.87 |
| 44469.270833333336 | 4.91 |
| 44469.28125 | 4.92 |
| 44469.291666666664 | 4.66 |
| 44469.302083333336 | 4.52 |
| 44469.3125 | 4.31 |
| 44469.322916666664 | 4.26 |
| 44469.333333333336 | 4.47 |
| 44469.34375 | 4.64 |
| 44469.354166666664 | 5.08 |
| 44469.364583333336 | 5.95 |
| 44469.375 | 5.76 |
| 44469.385416666664 | 5.99 |
| 44469.395833333336 | 6.02 |
| 44469.40625 | 5.78 |
| 44469.416666666664 | 5.78 |
| 44469.427083333336 | 5.67 |
| 44469.4375 | 5.72 |
| 44469.447916666664 | 5.67 |
| 44469.458333333336 | 5.43 |
| 44469.46875 | 5.46 |
| 44469.479166666664 | 5.44 |
| 44469.489583333336 | 5.39 |
| 44469.5 | 5.52 |
| 44469.510416666664 | 5.42 |
| 44469.520833333336 | 5.54 |
| 44469.53125 | 5.55 |
| 44469.541666666664 | 5.56 |
| 44469.552083333336 | 5.78 |
| 44469.5625 | 5.43 |
| 44469.572916666664 | 5.35 |
| 44469.583333333336 | 5.24 |
| 44469.59375 | 5.21 |
| 44469.604166666664 | 5.23 |
| 44469.614583333336 | 5.22 |
| 44469.625 | 5.33 |
| 44469.635416666664 | 5.41 |
| 44469.645833333336 | 5.35 |
| 44469.65625 | 5.45 |
| 44469.666666666664 | 5.67 |
| 44469.677083333336 | 5.91 |
| 44469.6875 | 6.06 |
| 44469.697916666664 | 6.22 |
| 44469.708333333336 | 6.31 |
| 44469.71875 | 6.4 |
| 44469.729166666664 | 6.55 |
| 44469.739583333336 | 6.57 |
| 44469.75 | 6.87 |
| 44469.760416666664 | 6.87 |
| 44469.770833333336 | 6.99 |
| 44469.78125 | 7.05 |
| 44469.791666666664 | 7.12 |
| 44469.802083333336 | 7.15 |
| 44469.8125 | 7.32 |
| 44469.822916666664 | 7.51 |
| 44469.833333333336 | 7.52 |
| 44469.84375 | 7.51 |
| 44469.854166666664 | 7.51 |
| 44469.864583333336 | 7.56 |
| 44469.875 | 7.63 |
| 44469.885416666664 | 7.59 |
| 44469.895833333336 | 7.6 |
| 44469.90625 | 7.48 |
| 44469.916666666664 | 7.37 |
| 44469.927083333336 | 7.35 |
| 44469.9375 | 7.37 |
| 44469.947916666664 | 7.21 |
| 44469.958333333336 | 7.14 |
| 44469.96875 | 6.92 |
| 44469.979166666664 | 6.38 |
| 44469.989583333336 | 6.49 |
| 44470.0 | 6.47 |
| 44470.010416666664 | 6.4 |
| 44470.020833333336 | 6.35 |
| 44470.03125 | 6.19 |
| 44470.041666666664 | 6.22 |
| 44470.052083333336 | 6.14 |
| 44470.0625 | 5.94 |
| 44470.072916666664 | 6.34 |
| 44470.083333333336 | 5.97 |
| 44470.09375 | 6.35 |
| 44470.104166666664 | 5.98 |
| 44470.114583333336 | 6.15 |
| 44470.125 | 6.19 |
| 44470.135416666664 | 4.9 |
| 44470.145833333336 | 4.43 |
| 44470.15625 | 4.57 |